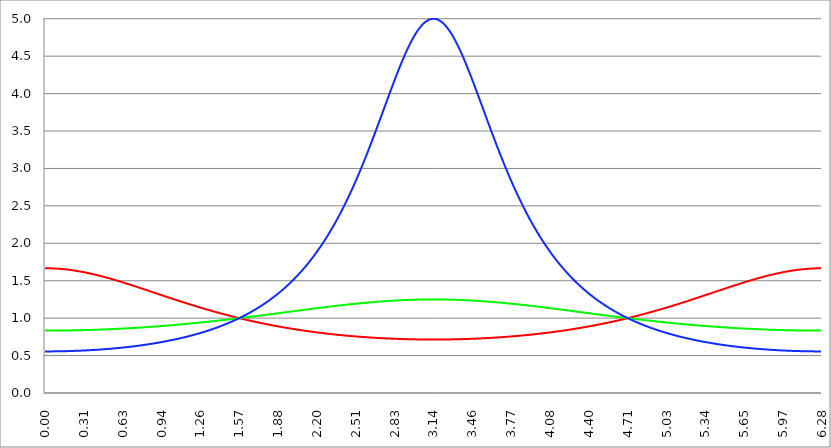
| Category | Series 1 | Series 0 | Series 2 |
|---|---|---|---|
| 0.0 | 1.667 | 0.833 | 0.556 |
| 0.00314159265358979 | 1.667 | 0.833 | 0.556 |
| 0.00628318530717958 | 1.667 | 0.833 | 0.556 |
| 0.00942477796076938 | 1.667 | 0.833 | 0.556 |
| 0.0125663706143592 | 1.667 | 0.833 | 0.556 |
| 0.015707963267949 | 1.667 | 0.833 | 0.556 |
| 0.0188495559215388 | 1.666 | 0.833 | 0.556 |
| 0.0219911485751285 | 1.666 | 0.833 | 0.556 |
| 0.0251327412287183 | 1.666 | 0.833 | 0.556 |
| 0.0282743338823081 | 1.666 | 0.833 | 0.556 |
| 0.0314159265358979 | 1.666 | 0.833 | 0.556 |
| 0.0345575191894877 | 1.666 | 0.833 | 0.556 |
| 0.0376991118430775 | 1.666 | 0.833 | 0.556 |
| 0.0408407044966673 | 1.666 | 0.833 | 0.556 |
| 0.0439822971502571 | 1.666 | 0.833 | 0.556 |
| 0.0471238898038469 | 1.665 | 0.833 | 0.556 |
| 0.0502654824574367 | 1.665 | 0.834 | 0.556 |
| 0.0534070751110265 | 1.665 | 0.834 | 0.556 |
| 0.0565486677646163 | 1.665 | 0.834 | 0.556 |
| 0.059690260418206 | 1.665 | 0.834 | 0.556 |
| 0.0628318530717958 | 1.664 | 0.834 | 0.556 |
| 0.0659734457253856 | 1.664 | 0.834 | 0.556 |
| 0.0691150383789754 | 1.664 | 0.834 | 0.556 |
| 0.0722566310325652 | 1.664 | 0.834 | 0.556 |
| 0.075398223686155 | 1.664 | 0.834 | 0.556 |
| 0.0785398163397448 | 1.663 | 0.834 | 0.556 |
| 0.0816814089933346 | 1.663 | 0.834 | 0.556 |
| 0.0848230016469244 | 1.663 | 0.834 | 0.556 |
| 0.0879645943005142 | 1.662 | 0.834 | 0.557 |
| 0.091106186954104 | 1.662 | 0.834 | 0.557 |
| 0.0942477796076937 | 1.662 | 0.834 | 0.557 |
| 0.0973893722612835 | 1.661 | 0.834 | 0.557 |
| 0.100530964914873 | 1.661 | 0.834 | 0.557 |
| 0.103672557568463 | 1.661 | 0.834 | 0.557 |
| 0.106814150222053 | 1.66 | 0.834 | 0.557 |
| 0.109955742875643 | 1.66 | 0.834 | 0.557 |
| 0.113097335529233 | 1.66 | 0.834 | 0.557 |
| 0.116238928182822 | 1.659 | 0.834 | 0.557 |
| 0.119380520836412 | 1.659 | 0.834 | 0.557 |
| 0.122522113490002 | 1.658 | 0.834 | 0.557 |
| 0.125663706143592 | 1.658 | 0.834 | 0.558 |
| 0.128805298797181 | 1.658 | 0.834 | 0.558 |
| 0.131946891450771 | 1.657 | 0.835 | 0.558 |
| 0.135088484104361 | 1.657 | 0.835 | 0.558 |
| 0.138230076757951 | 1.656 | 0.835 | 0.558 |
| 0.141371669411541 | 1.656 | 0.835 | 0.558 |
| 0.14451326206513 | 1.655 | 0.835 | 0.558 |
| 0.14765485471872 | 1.655 | 0.835 | 0.558 |
| 0.15079644737231 | 1.654 | 0.835 | 0.558 |
| 0.1539380400259 | 1.654 | 0.835 | 0.558 |
| 0.15707963267949 | 1.653 | 0.835 | 0.559 |
| 0.160221225333079 | 1.653 | 0.835 | 0.559 |
| 0.163362817986669 | 1.652 | 0.835 | 0.559 |
| 0.166504410640259 | 1.651 | 0.835 | 0.559 |
| 0.169646003293849 | 1.651 | 0.835 | 0.559 |
| 0.172787595947439 | 1.65 | 0.835 | 0.559 |
| 0.175929188601028 | 1.65 | 0.835 | 0.559 |
| 0.179070781254618 | 1.649 | 0.836 | 0.56 |
| 0.182212373908208 | 1.648 | 0.836 | 0.56 |
| 0.185353966561798 | 1.648 | 0.836 | 0.56 |
| 0.188495559215388 | 1.647 | 0.836 | 0.56 |
| 0.191637151868977 | 1.647 | 0.836 | 0.56 |
| 0.194778744522567 | 1.646 | 0.836 | 0.56 |
| 0.197920337176157 | 1.645 | 0.836 | 0.56 |
| 0.201061929829747 | 1.645 | 0.836 | 0.561 |
| 0.204203522483336 | 1.644 | 0.836 | 0.561 |
| 0.207345115136926 | 1.643 | 0.836 | 0.561 |
| 0.210486707790516 | 1.642 | 0.836 | 0.561 |
| 0.213628300444106 | 1.642 | 0.837 | 0.561 |
| 0.216769893097696 | 1.641 | 0.837 | 0.561 |
| 0.219911485751285 | 1.64 | 0.837 | 0.562 |
| 0.223053078404875 | 1.64 | 0.837 | 0.562 |
| 0.226194671058465 | 1.639 | 0.837 | 0.562 |
| 0.229336263712055 | 1.638 | 0.837 | 0.562 |
| 0.232477856365645 | 1.637 | 0.837 | 0.562 |
| 0.235619449019234 | 1.637 | 0.837 | 0.562 |
| 0.238761041672824 | 1.636 | 0.837 | 0.563 |
| 0.241902634326414 | 1.635 | 0.837 | 0.563 |
| 0.245044226980004 | 1.634 | 0.838 | 0.563 |
| 0.248185819633594 | 1.633 | 0.838 | 0.563 |
| 0.251327412287183 | 1.632 | 0.838 | 0.563 |
| 0.254469004940773 | 1.632 | 0.838 | 0.564 |
| 0.257610597594363 | 1.631 | 0.838 | 0.564 |
| 0.260752190247953 | 1.63 | 0.838 | 0.564 |
| 0.263893782901543 | 1.629 | 0.838 | 0.564 |
| 0.267035375555132 | 1.628 | 0.838 | 0.564 |
| 0.270176968208722 | 1.627 | 0.838 | 0.565 |
| 0.273318560862312 | 1.626 | 0.839 | 0.565 |
| 0.276460153515902 | 1.626 | 0.839 | 0.565 |
| 0.279601746169492 | 1.625 | 0.839 | 0.565 |
| 0.282743338823082 | 1.624 | 0.839 | 0.566 |
| 0.285884931476671 | 1.623 | 0.839 | 0.566 |
| 0.289026524130261 | 1.622 | 0.839 | 0.566 |
| 0.292168116783851 | 1.621 | 0.839 | 0.566 |
| 0.295309709437441 | 1.62 | 0.839 | 0.566 |
| 0.298451302091031 | 1.619 | 0.84 | 0.567 |
| 0.30159289474462 | 1.618 | 0.84 | 0.567 |
| 0.30473448739821 | 1.617 | 0.84 | 0.567 |
| 0.3078760800518 | 1.616 | 0.84 | 0.567 |
| 0.31101767270539 | 1.615 | 0.84 | 0.568 |
| 0.31415926535898 | 1.614 | 0.84 | 0.568 |
| 0.31730085801257 | 1.613 | 0.84 | 0.568 |
| 0.320442450666159 | 1.612 | 0.84 | 0.568 |
| 0.323584043319749 | 1.611 | 0.841 | 0.569 |
| 0.326725635973339 | 1.61 | 0.841 | 0.569 |
| 0.329867228626929 | 1.609 | 0.841 | 0.569 |
| 0.333008821280519 | 1.608 | 0.841 | 0.569 |
| 0.336150413934108 | 1.607 | 0.841 | 0.57 |
| 0.339292006587698 | 1.606 | 0.841 | 0.57 |
| 0.342433599241288 | 1.605 | 0.841 | 0.57 |
| 0.345575191894878 | 1.603 | 0.842 | 0.571 |
| 0.348716784548468 | 1.602 | 0.842 | 0.571 |
| 0.351858377202058 | 1.601 | 0.842 | 0.571 |
| 0.354999969855647 | 1.6 | 0.842 | 0.571 |
| 0.358141562509237 | 1.599 | 0.842 | 0.572 |
| 0.361283155162827 | 1.598 | 0.842 | 0.572 |
| 0.364424747816417 | 1.597 | 0.843 | 0.572 |
| 0.367566340470007 | 1.596 | 0.843 | 0.573 |
| 0.370707933123597 | 1.594 | 0.843 | 0.573 |
| 0.373849525777186 | 1.593 | 0.843 | 0.573 |
| 0.376991118430776 | 1.592 | 0.843 | 0.573 |
| 0.380132711084366 | 1.591 | 0.843 | 0.574 |
| 0.383274303737956 | 1.59 | 0.844 | 0.574 |
| 0.386415896391546 | 1.589 | 0.844 | 0.574 |
| 0.389557489045135 | 1.587 | 0.844 | 0.575 |
| 0.392699081698725 | 1.586 | 0.844 | 0.575 |
| 0.395840674352315 | 1.585 | 0.844 | 0.575 |
| 0.398982267005905 | 1.584 | 0.844 | 0.576 |
| 0.402123859659495 | 1.583 | 0.845 | 0.576 |
| 0.405265452313085 | 1.581 | 0.845 | 0.576 |
| 0.408407044966674 | 1.58 | 0.845 | 0.577 |
| 0.411548637620264 | 1.579 | 0.845 | 0.577 |
| 0.414690230273854 | 1.578 | 0.845 | 0.577 |
| 0.417831822927444 | 1.576 | 0.845 | 0.578 |
| 0.420973415581034 | 1.575 | 0.846 | 0.578 |
| 0.424115008234623 | 1.574 | 0.846 | 0.578 |
| 0.427256600888213 | 1.572 | 0.846 | 0.579 |
| 0.430398193541803 | 1.571 | 0.846 | 0.579 |
| 0.433539786195393 | 1.57 | 0.846 | 0.579 |
| 0.436681378848983 | 1.569 | 0.847 | 0.58 |
| 0.439822971502573 | 1.567 | 0.847 | 0.58 |
| 0.442964564156162 | 1.566 | 0.847 | 0.58 |
| 0.446106156809752 | 1.565 | 0.847 | 0.581 |
| 0.449247749463342 | 1.563 | 0.847 | 0.581 |
| 0.452389342116932 | 1.562 | 0.848 | 0.582 |
| 0.455530934770522 | 1.561 | 0.848 | 0.582 |
| 0.458672527424111 | 1.559 | 0.848 | 0.582 |
| 0.461814120077701 | 1.558 | 0.848 | 0.583 |
| 0.464955712731291 | 1.557 | 0.848 | 0.583 |
| 0.468097305384881 | 1.555 | 0.849 | 0.583 |
| 0.471238898038471 | 1.554 | 0.849 | 0.584 |
| 0.474380490692061 | 1.552 | 0.849 | 0.584 |
| 0.47752208334565 | 1.551 | 0.849 | 0.585 |
| 0.48066367599924 | 1.55 | 0.849 | 0.585 |
| 0.48380526865283 | 1.548 | 0.85 | 0.585 |
| 0.48694686130642 | 1.547 | 0.85 | 0.586 |
| 0.49008845396001 | 1.545 | 0.85 | 0.586 |
| 0.493230046613599 | 1.544 | 0.85 | 0.587 |
| 0.496371639267189 | 1.543 | 0.85 | 0.587 |
| 0.499513231920779 | 1.541 | 0.851 | 0.587 |
| 0.502654824574369 | 1.54 | 0.851 | 0.588 |
| 0.505796417227959 | 1.538 | 0.851 | 0.588 |
| 0.508938009881549 | 1.537 | 0.851 | 0.589 |
| 0.512079602535138 | 1.535 | 0.852 | 0.589 |
| 0.515221195188728 | 1.534 | 0.852 | 0.59 |
| 0.518362787842318 | 1.532 | 0.852 | 0.59 |
| 0.521504380495908 | 1.531 | 0.852 | 0.59 |
| 0.524645973149498 | 1.53 | 0.852 | 0.591 |
| 0.527787565803087 | 1.528 | 0.853 | 0.591 |
| 0.530929158456677 | 1.527 | 0.853 | 0.592 |
| 0.534070751110267 | 1.525 | 0.853 | 0.592 |
| 0.537212343763857 | 1.524 | 0.853 | 0.593 |
| 0.540353936417447 | 1.522 | 0.854 | 0.593 |
| 0.543495529071037 | 1.521 | 0.854 | 0.594 |
| 0.546637121724626 | 1.519 | 0.854 | 0.594 |
| 0.549778714378216 | 1.518 | 0.854 | 0.594 |
| 0.552920307031806 | 1.516 | 0.855 | 0.595 |
| 0.556061899685396 | 1.515 | 0.855 | 0.595 |
| 0.559203492338986 | 1.513 | 0.855 | 0.596 |
| 0.562345084992576 | 1.511 | 0.855 | 0.596 |
| 0.565486677646165 | 1.51 | 0.856 | 0.597 |
| 0.568628270299755 | 1.508 | 0.856 | 0.597 |
| 0.571769862953345 | 1.507 | 0.856 | 0.598 |
| 0.574911455606935 | 1.505 | 0.856 | 0.598 |
| 0.578053048260525 | 1.504 | 0.857 | 0.599 |
| 0.581194640914114 | 1.502 | 0.857 | 0.599 |
| 0.584336233567704 | 1.501 | 0.857 | 0.6 |
| 0.587477826221294 | 1.499 | 0.857 | 0.6 |
| 0.590619418874884 | 1.498 | 0.858 | 0.601 |
| 0.593761011528474 | 1.496 | 0.858 | 0.601 |
| 0.596902604182064 | 1.494 | 0.858 | 0.602 |
| 0.600044196835653 | 1.493 | 0.858 | 0.602 |
| 0.603185789489243 | 1.491 | 0.859 | 0.603 |
| 0.606327382142833 | 1.49 | 0.859 | 0.603 |
| 0.609468974796423 | 1.488 | 0.859 | 0.604 |
| 0.612610567450013 | 1.486 | 0.859 | 0.604 |
| 0.615752160103602 | 1.485 | 0.86 | 0.605 |
| 0.618893752757192 | 1.483 | 0.86 | 0.605 |
| 0.622035345410782 | 1.482 | 0.86 | 0.606 |
| 0.625176938064372 | 1.48 | 0.86 | 0.607 |
| 0.628318530717962 | 1.478 | 0.861 | 0.607 |
| 0.631460123371551 | 1.477 | 0.861 | 0.608 |
| 0.634601716025141 | 1.475 | 0.861 | 0.608 |
| 0.637743308678731 | 1.474 | 0.862 | 0.609 |
| 0.640884901332321 | 1.472 | 0.862 | 0.609 |
| 0.644026493985911 | 1.47 | 0.862 | 0.61 |
| 0.647168086639501 | 1.469 | 0.862 | 0.61 |
| 0.65030967929309 | 1.467 | 0.863 | 0.611 |
| 0.65345127194668 | 1.465 | 0.863 | 0.612 |
| 0.65659286460027 | 1.464 | 0.863 | 0.612 |
| 0.65973445725386 | 1.462 | 0.864 | 0.613 |
| 0.66287604990745 | 1.46 | 0.864 | 0.613 |
| 0.666017642561039 | 1.459 | 0.864 | 0.614 |
| 0.669159235214629 | 1.457 | 0.864 | 0.614 |
| 0.672300827868219 | 1.456 | 0.865 | 0.615 |
| 0.675442420521809 | 1.454 | 0.865 | 0.616 |
| 0.678584013175399 | 1.452 | 0.865 | 0.616 |
| 0.681725605828989 | 1.451 | 0.866 | 0.617 |
| 0.684867198482578 | 1.449 | 0.866 | 0.617 |
| 0.688008791136168 | 1.447 | 0.866 | 0.618 |
| 0.691150383789758 | 1.446 | 0.866 | 0.619 |
| 0.694291976443348 | 1.444 | 0.867 | 0.619 |
| 0.697433569096938 | 1.442 | 0.867 | 0.62 |
| 0.700575161750528 | 1.44 | 0.867 | 0.621 |
| 0.703716754404117 | 1.439 | 0.868 | 0.621 |
| 0.706858347057707 | 1.437 | 0.868 | 0.622 |
| 0.709999939711297 | 1.435 | 0.868 | 0.622 |
| 0.713141532364887 | 1.434 | 0.869 | 0.623 |
| 0.716283125018477 | 1.432 | 0.869 | 0.624 |
| 0.719424717672066 | 1.43 | 0.869 | 0.624 |
| 0.722566310325656 | 1.429 | 0.87 | 0.625 |
| 0.725707902979246 | 1.427 | 0.87 | 0.626 |
| 0.728849495632836 | 1.425 | 0.87 | 0.626 |
| 0.731991088286426 | 1.424 | 0.87 | 0.627 |
| 0.735132680940016 | 1.422 | 0.871 | 0.628 |
| 0.738274273593605 | 1.42 | 0.871 | 0.628 |
| 0.741415866247195 | 1.418 | 0.871 | 0.629 |
| 0.744557458900785 | 1.417 | 0.872 | 0.63 |
| 0.747699051554375 | 1.415 | 0.872 | 0.63 |
| 0.750840644207965 | 1.413 | 0.872 | 0.631 |
| 0.753982236861554 | 1.412 | 0.873 | 0.632 |
| 0.757123829515144 | 1.41 | 0.873 | 0.632 |
| 0.760265422168734 | 1.408 | 0.873 | 0.633 |
| 0.763407014822324 | 1.406 | 0.874 | 0.634 |
| 0.766548607475914 | 1.405 | 0.874 | 0.634 |
| 0.769690200129504 | 1.403 | 0.874 | 0.635 |
| 0.772831792783093 | 1.401 | 0.875 | 0.636 |
| 0.775973385436683 | 1.4 | 0.875 | 0.637 |
| 0.779114978090273 | 1.398 | 0.875 | 0.637 |
| 0.782256570743863 | 1.396 | 0.876 | 0.638 |
| 0.785398163397453 | 1.394 | 0.876 | 0.639 |
| 0.788539756051042 | 1.393 | 0.876 | 0.639 |
| 0.791681348704632 | 1.391 | 0.877 | 0.64 |
| 0.794822941358222 | 1.389 | 0.877 | 0.641 |
| 0.797964534011812 | 1.387 | 0.877 | 0.642 |
| 0.801106126665402 | 1.386 | 0.878 | 0.642 |
| 0.804247719318992 | 1.384 | 0.878 | 0.643 |
| 0.807389311972581 | 1.382 | 0.879 | 0.644 |
| 0.810530904626171 | 1.381 | 0.879 | 0.645 |
| 0.813672497279761 | 1.379 | 0.879 | 0.645 |
| 0.816814089933351 | 1.377 | 0.88 | 0.646 |
| 0.819955682586941 | 1.375 | 0.88 | 0.647 |
| 0.823097275240531 | 1.374 | 0.88 | 0.648 |
| 0.82623886789412 | 1.372 | 0.881 | 0.648 |
| 0.82938046054771 | 1.37 | 0.881 | 0.649 |
| 0.8325220532013 | 1.368 | 0.881 | 0.65 |
| 0.83566364585489 | 1.367 | 0.882 | 0.651 |
| 0.83880523850848 | 1.365 | 0.882 | 0.652 |
| 0.841946831162069 | 1.363 | 0.882 | 0.652 |
| 0.845088423815659 | 1.361 | 0.883 | 0.653 |
| 0.848230016469249 | 1.36 | 0.883 | 0.654 |
| 0.851371609122839 | 1.358 | 0.884 | 0.655 |
| 0.854513201776429 | 1.356 | 0.884 | 0.656 |
| 0.857654794430019 | 1.354 | 0.884 | 0.656 |
| 0.860796387083608 | 1.353 | 0.885 | 0.657 |
| 0.863937979737198 | 1.351 | 0.885 | 0.658 |
| 0.867079572390788 | 1.349 | 0.885 | 0.659 |
| 0.870221165044378 | 1.347 | 0.886 | 0.66 |
| 0.873362757697968 | 1.346 | 0.886 | 0.661 |
| 0.876504350351557 | 1.344 | 0.887 | 0.661 |
| 0.879645943005147 | 1.342 | 0.887 | 0.662 |
| 0.882787535658737 | 1.34 | 0.887 | 0.663 |
| 0.885929128312327 | 1.339 | 0.888 | 0.664 |
| 0.889070720965917 | 1.337 | 0.888 | 0.665 |
| 0.892212313619507 | 1.335 | 0.888 | 0.666 |
| 0.895353906273096 | 1.334 | 0.889 | 0.667 |
| 0.898495498926686 | 1.332 | 0.889 | 0.667 |
| 0.901637091580276 | 1.33 | 0.89 | 0.668 |
| 0.904778684233866 | 1.328 | 0.89 | 0.669 |
| 0.907920276887456 | 1.327 | 0.89 | 0.67 |
| 0.911061869541045 | 1.325 | 0.891 | 0.671 |
| 0.914203462194635 | 1.323 | 0.891 | 0.672 |
| 0.917345054848225 | 1.321 | 0.892 | 0.673 |
| 0.920486647501815 | 1.32 | 0.892 | 0.674 |
| 0.923628240155405 | 1.318 | 0.892 | 0.675 |
| 0.926769832808995 | 1.316 | 0.893 | 0.676 |
| 0.929911425462584 | 1.314 | 0.893 | 0.676 |
| 0.933053018116174 | 1.313 | 0.894 | 0.677 |
| 0.936194610769764 | 1.311 | 0.894 | 0.678 |
| 0.939336203423354 | 1.309 | 0.894 | 0.679 |
| 0.942477796076944 | 1.307 | 0.895 | 0.68 |
| 0.945619388730533 | 1.306 | 0.895 | 0.681 |
| 0.948760981384123 | 1.304 | 0.896 | 0.682 |
| 0.951902574037713 | 1.302 | 0.896 | 0.683 |
| 0.955044166691303 | 1.3 | 0.896 | 0.684 |
| 0.958185759344893 | 1.299 | 0.897 | 0.685 |
| 0.961327351998483 | 1.297 | 0.897 | 0.686 |
| 0.964468944652072 | 1.295 | 0.898 | 0.687 |
| 0.967610537305662 | 1.294 | 0.898 | 0.688 |
| 0.970752129959252 | 1.292 | 0.899 | 0.689 |
| 0.973893722612842 | 1.29 | 0.899 | 0.69 |
| 0.977035315266432 | 1.288 | 0.899 | 0.691 |
| 0.980176907920022 | 1.287 | 0.9 | 0.692 |
| 0.983318500573611 | 1.285 | 0.9 | 0.693 |
| 0.986460093227201 | 1.283 | 0.901 | 0.694 |
| 0.989601685880791 | 1.281 | 0.901 | 0.695 |
| 0.992743278534381 | 1.28 | 0.901 | 0.696 |
| 0.995884871187971 | 1.278 | 0.902 | 0.697 |
| 0.99902646384156 | 1.276 | 0.902 | 0.698 |
| 1.00216805649515 | 1.275 | 0.903 | 0.699 |
| 1.00530964914874 | 1.273 | 0.903 | 0.7 |
| 1.00845124180233 | 1.271 | 0.904 | 0.701 |
| 1.01159283445592 | 1.269 | 0.904 | 0.702 |
| 1.01473442710951 | 1.268 | 0.905 | 0.703 |
| 1.017876019763099 | 1.266 | 0.905 | 0.704 |
| 1.021017612416689 | 1.264 | 0.905 | 0.705 |
| 1.02415920507028 | 1.263 | 0.906 | 0.706 |
| 1.027300797723869 | 1.261 | 0.906 | 0.707 |
| 1.030442390377459 | 1.259 | 0.907 | 0.708 |
| 1.033583983031048 | 1.257 | 0.907 | 0.71 |
| 1.036725575684638 | 1.256 | 0.908 | 0.711 |
| 1.039867168338228 | 1.254 | 0.908 | 0.712 |
| 1.043008760991818 | 1.252 | 0.908 | 0.713 |
| 1.046150353645408 | 1.251 | 0.909 | 0.714 |
| 1.049291946298998 | 1.249 | 0.909 | 0.715 |
| 1.052433538952587 | 1.247 | 0.91 | 0.716 |
| 1.055575131606177 | 1.245 | 0.91 | 0.717 |
| 1.058716724259767 | 1.244 | 0.911 | 0.718 |
| 1.061858316913357 | 1.242 | 0.911 | 0.72 |
| 1.064999909566947 | 1.24 | 0.912 | 0.721 |
| 1.068141502220536 | 1.239 | 0.912 | 0.722 |
| 1.071283094874126 | 1.237 | 0.913 | 0.723 |
| 1.074424687527716 | 1.235 | 0.913 | 0.724 |
| 1.077566280181306 | 1.234 | 0.913 | 0.725 |
| 1.080707872834896 | 1.232 | 0.914 | 0.726 |
| 1.083849465488486 | 1.23 | 0.914 | 0.728 |
| 1.086991058142075 | 1.229 | 0.915 | 0.729 |
| 1.090132650795665 | 1.227 | 0.915 | 0.73 |
| 1.093274243449255 | 1.225 | 0.916 | 0.731 |
| 1.096415836102845 | 1.224 | 0.916 | 0.732 |
| 1.099557428756435 | 1.222 | 0.917 | 0.734 |
| 1.102699021410025 | 1.22 | 0.917 | 0.735 |
| 1.105840614063614 | 1.219 | 0.918 | 0.736 |
| 1.108982206717204 | 1.217 | 0.918 | 0.737 |
| 1.112123799370794 | 1.215 | 0.919 | 0.738 |
| 1.115265392024384 | 1.214 | 0.919 | 0.74 |
| 1.118406984677974 | 1.212 | 0.92 | 0.741 |
| 1.121548577331563 | 1.21 | 0.92 | 0.742 |
| 1.124690169985153 | 1.209 | 0.921 | 0.743 |
| 1.127831762638743 | 1.207 | 0.921 | 0.745 |
| 1.130973355292333 | 1.205 | 0.922 | 0.746 |
| 1.134114947945923 | 1.204 | 0.922 | 0.747 |
| 1.137256540599513 | 1.202 | 0.922 | 0.748 |
| 1.140398133253102 | 1.2 | 0.923 | 0.75 |
| 1.143539725906692 | 1.199 | 0.923 | 0.751 |
| 1.146681318560282 | 1.197 | 0.924 | 0.752 |
| 1.149822911213872 | 1.195 | 0.924 | 0.754 |
| 1.152964503867462 | 1.194 | 0.925 | 0.755 |
| 1.156106096521051 | 1.192 | 0.925 | 0.756 |
| 1.159247689174641 | 1.19 | 0.926 | 0.758 |
| 1.162389281828231 | 1.189 | 0.926 | 0.759 |
| 1.165530874481821 | 1.187 | 0.927 | 0.76 |
| 1.168672467135411 | 1.186 | 0.927 | 0.762 |
| 1.171814059789001 | 1.184 | 0.928 | 0.763 |
| 1.17495565244259 | 1.182 | 0.928 | 0.764 |
| 1.17809724509618 | 1.181 | 0.929 | 0.766 |
| 1.18123883774977 | 1.179 | 0.929 | 0.767 |
| 1.18438043040336 | 1.178 | 0.93 | 0.768 |
| 1.18752202305695 | 1.176 | 0.93 | 0.77 |
| 1.190663615710539 | 1.174 | 0.931 | 0.771 |
| 1.193805208364129 | 1.173 | 0.931 | 0.772 |
| 1.19694680101772 | 1.171 | 0.932 | 0.774 |
| 1.200088393671309 | 1.169 | 0.932 | 0.775 |
| 1.203229986324899 | 1.168 | 0.933 | 0.777 |
| 1.206371578978489 | 1.166 | 0.933 | 0.778 |
| 1.209513171632078 | 1.165 | 0.934 | 0.78 |
| 1.212654764285668 | 1.163 | 0.934 | 0.781 |
| 1.215796356939258 | 1.161 | 0.935 | 0.782 |
| 1.218937949592848 | 1.16 | 0.936 | 0.784 |
| 1.222079542246438 | 1.158 | 0.936 | 0.785 |
| 1.225221134900027 | 1.157 | 0.937 | 0.787 |
| 1.228362727553617 | 1.155 | 0.937 | 0.788 |
| 1.231504320207207 | 1.154 | 0.938 | 0.79 |
| 1.234645912860797 | 1.152 | 0.938 | 0.791 |
| 1.237787505514387 | 1.15 | 0.939 | 0.793 |
| 1.240929098167977 | 1.149 | 0.939 | 0.794 |
| 1.244070690821566 | 1.147 | 0.94 | 0.796 |
| 1.247212283475156 | 1.146 | 0.94 | 0.797 |
| 1.250353876128746 | 1.144 | 0.941 | 0.799 |
| 1.253495468782336 | 1.143 | 0.941 | 0.8 |
| 1.256637061435926 | 1.141 | 0.942 | 0.802 |
| 1.259778654089515 | 1.139 | 0.942 | 0.803 |
| 1.262920246743105 | 1.138 | 0.943 | 0.805 |
| 1.266061839396695 | 1.136 | 0.943 | 0.806 |
| 1.269203432050285 | 1.135 | 0.944 | 0.808 |
| 1.272345024703875 | 1.133 | 0.944 | 0.81 |
| 1.275486617357465 | 1.132 | 0.945 | 0.811 |
| 1.278628210011054 | 1.13 | 0.946 | 0.813 |
| 1.281769802664644 | 1.129 | 0.946 | 0.814 |
| 1.284911395318234 | 1.127 | 0.947 | 0.816 |
| 1.288052987971824 | 1.126 | 0.947 | 0.818 |
| 1.291194580625414 | 1.124 | 0.948 | 0.819 |
| 1.294336173279003 | 1.123 | 0.948 | 0.821 |
| 1.297477765932593 | 1.121 | 0.949 | 0.822 |
| 1.300619358586183 | 1.12 | 0.949 | 0.824 |
| 1.303760951239773 | 1.118 | 0.95 | 0.826 |
| 1.306902543893363 | 1.116 | 0.95 | 0.827 |
| 1.310044136546953 | 1.115 | 0.951 | 0.829 |
| 1.313185729200542 | 1.113 | 0.952 | 0.831 |
| 1.316327321854132 | 1.112 | 0.952 | 0.832 |
| 1.319468914507722 | 1.11 | 0.953 | 0.834 |
| 1.322610507161312 | 1.109 | 0.953 | 0.836 |
| 1.325752099814902 | 1.107 | 0.954 | 0.837 |
| 1.328893692468491 | 1.106 | 0.954 | 0.839 |
| 1.332035285122081 | 1.104 | 0.955 | 0.841 |
| 1.335176877775671 | 1.103 | 0.955 | 0.843 |
| 1.338318470429261 | 1.102 | 0.956 | 0.844 |
| 1.341460063082851 | 1.1 | 0.957 | 0.846 |
| 1.344601655736441 | 1.099 | 0.957 | 0.848 |
| 1.34774324839003 | 1.097 | 0.958 | 0.85 |
| 1.35088484104362 | 1.096 | 0.958 | 0.851 |
| 1.35402643369721 | 1.094 | 0.959 | 0.853 |
| 1.3571680263508 | 1.093 | 0.959 | 0.855 |
| 1.36030961900439 | 1.091 | 0.96 | 0.857 |
| 1.363451211657979 | 1.09 | 0.96 | 0.859 |
| 1.36659280431157 | 1.088 | 0.961 | 0.86 |
| 1.369734396965159 | 1.087 | 0.962 | 0.862 |
| 1.372875989618749 | 1.085 | 0.962 | 0.864 |
| 1.376017582272339 | 1.084 | 0.963 | 0.866 |
| 1.379159174925929 | 1.082 | 0.963 | 0.868 |
| 1.382300767579518 | 1.081 | 0.964 | 0.87 |
| 1.385442360233108 | 1.08 | 0.964 | 0.872 |
| 1.388583952886698 | 1.078 | 0.965 | 0.873 |
| 1.391725545540288 | 1.077 | 0.966 | 0.875 |
| 1.394867138193878 | 1.075 | 0.966 | 0.877 |
| 1.398008730847468 | 1.074 | 0.967 | 0.879 |
| 1.401150323501057 | 1.072 | 0.967 | 0.881 |
| 1.404291916154647 | 1.071 | 0.968 | 0.883 |
| 1.407433508808237 | 1.07 | 0.968 | 0.885 |
| 1.410575101461827 | 1.068 | 0.969 | 0.887 |
| 1.413716694115417 | 1.067 | 0.97 | 0.889 |
| 1.416858286769006 | 1.065 | 0.97 | 0.891 |
| 1.419999879422596 | 1.064 | 0.971 | 0.893 |
| 1.423141472076186 | 1.063 | 0.971 | 0.895 |
| 1.426283064729776 | 1.061 | 0.972 | 0.897 |
| 1.429424657383366 | 1.06 | 0.973 | 0.899 |
| 1.432566250036956 | 1.058 | 0.973 | 0.901 |
| 1.435707842690545 | 1.057 | 0.974 | 0.903 |
| 1.438849435344135 | 1.056 | 0.974 | 0.905 |
| 1.441991027997725 | 1.054 | 0.975 | 0.907 |
| 1.445132620651315 | 1.053 | 0.976 | 0.909 |
| 1.448274213304905 | 1.051 | 0.976 | 0.911 |
| 1.451415805958494 | 1.05 | 0.977 | 0.913 |
| 1.454557398612084 | 1.049 | 0.977 | 0.915 |
| 1.457698991265674 | 1.047 | 0.978 | 0.917 |
| 1.460840583919264 | 1.046 | 0.979 | 0.919 |
| 1.463982176572854 | 1.045 | 0.979 | 0.921 |
| 1.467123769226444 | 1.043 | 0.98 | 0.924 |
| 1.470265361880033 | 1.042 | 0.98 | 0.926 |
| 1.473406954533623 | 1.04 | 0.981 | 0.928 |
| 1.476548547187213 | 1.039 | 0.982 | 0.93 |
| 1.479690139840803 | 1.038 | 0.982 | 0.932 |
| 1.482831732494393 | 1.036 | 0.983 | 0.934 |
| 1.485973325147982 | 1.035 | 0.983 | 0.937 |
| 1.489114917801572 | 1.034 | 0.984 | 0.939 |
| 1.492256510455162 | 1.032 | 0.985 | 0.941 |
| 1.495398103108752 | 1.031 | 0.985 | 0.943 |
| 1.498539695762342 | 1.03 | 0.986 | 0.945 |
| 1.501681288415932 | 1.028 | 0.986 | 0.948 |
| 1.504822881069521 | 1.027 | 0.987 | 0.95 |
| 1.507964473723111 | 1.026 | 0.988 | 0.952 |
| 1.511106066376701 | 1.024 | 0.988 | 0.954 |
| 1.514247659030291 | 1.023 | 0.989 | 0.957 |
| 1.517389251683881 | 1.022 | 0.989 | 0.959 |
| 1.520530844337471 | 1.021 | 0.99 | 0.961 |
| 1.52367243699106 | 1.019 | 0.991 | 0.964 |
| 1.52681402964465 | 1.018 | 0.991 | 0.966 |
| 1.52995562229824 | 1.017 | 0.992 | 0.968 |
| 1.53309721495183 | 1.015 | 0.993 | 0.971 |
| 1.53623880760542 | 1.014 | 0.993 | 0.973 |
| 1.539380400259009 | 1.013 | 0.994 | 0.975 |
| 1.542521992912599 | 1.011 | 0.994 | 0.978 |
| 1.545663585566189 | 1.01 | 0.995 | 0.98 |
| 1.548805178219779 | 1.009 | 0.996 | 0.983 |
| 1.551946770873369 | 1.008 | 0.996 | 0.985 |
| 1.555088363526959 | 1.006 | 0.997 | 0.988 |
| 1.558229956180548 | 1.005 | 0.997 | 0.99 |
| 1.561371548834138 | 1.004 | 0.998 | 0.993 |
| 1.564513141487728 | 1.003 | 0.999 | 0.995 |
| 1.567654734141318 | 1.001 | 0.999 | 0.997 |
| 1.570796326794908 | 1 | 1 | 1 |
| 1.573937919448497 | 0.999 | 1.001 | 1.003 |
| 1.577079512102087 | 0.997 | 1.001 | 1.005 |
| 1.580221104755677 | 0.996 | 1.002 | 1.008 |
| 1.583362697409267 | 0.995 | 1.003 | 1.01 |
| 1.586504290062857 | 0.994 | 1.003 | 1.013 |
| 1.589645882716447 | 0.993 | 1.004 | 1.015 |
| 1.592787475370036 | 0.991 | 1.004 | 1.018 |
| 1.595929068023626 | 0.99 | 1.005 | 1.021 |
| 1.599070660677216 | 0.989 | 1.006 | 1.023 |
| 1.602212253330806 | 0.988 | 1.006 | 1.026 |
| 1.605353845984396 | 0.986 | 1.007 | 1.028 |
| 1.608495438637985 | 0.985 | 1.008 | 1.031 |
| 1.611637031291575 | 0.984 | 1.008 | 1.034 |
| 1.614778623945165 | 0.983 | 1.009 | 1.036 |
| 1.617920216598755 | 0.982 | 1.01 | 1.039 |
| 1.621061809252345 | 0.98 | 1.01 | 1.042 |
| 1.624203401905935 | 0.979 | 1.011 | 1.045 |
| 1.627344994559524 | 0.978 | 1.011 | 1.047 |
| 1.630486587213114 | 0.977 | 1.012 | 1.05 |
| 1.633628179866704 | 0.975 | 1.013 | 1.053 |
| 1.636769772520294 | 0.974 | 1.013 | 1.056 |
| 1.639911365173884 | 0.973 | 1.014 | 1.058 |
| 1.643052957827473 | 0.972 | 1.015 | 1.061 |
| 1.646194550481063 | 0.971 | 1.015 | 1.064 |
| 1.649336143134653 | 0.97 | 1.016 | 1.067 |
| 1.652477735788243 | 0.968 | 1.017 | 1.07 |
| 1.655619328441833 | 0.967 | 1.017 | 1.073 |
| 1.658760921095423 | 0.966 | 1.018 | 1.076 |
| 1.661902513749012 | 0.965 | 1.019 | 1.078 |
| 1.665044106402602 | 0.964 | 1.019 | 1.081 |
| 1.668185699056192 | 0.963 | 1.02 | 1.084 |
| 1.671327291709782 | 0.961 | 1.02 | 1.087 |
| 1.674468884363372 | 0.96 | 1.021 | 1.09 |
| 1.677610477016961 | 0.959 | 1.022 | 1.093 |
| 1.680752069670551 | 0.958 | 1.022 | 1.096 |
| 1.683893662324141 | 0.957 | 1.023 | 1.099 |
| 1.687035254977731 | 0.956 | 1.024 | 1.102 |
| 1.690176847631321 | 0.955 | 1.024 | 1.105 |
| 1.693318440284911 | 0.953 | 1.025 | 1.108 |
| 1.6964600329385 | 0.952 | 1.026 | 1.111 |
| 1.69960162559209 | 0.951 | 1.026 | 1.115 |
| 1.70274321824568 | 0.95 | 1.027 | 1.118 |
| 1.70588481089927 | 0.949 | 1.028 | 1.121 |
| 1.70902640355286 | 0.948 | 1.028 | 1.124 |
| 1.712167996206449 | 0.947 | 1.029 | 1.127 |
| 1.715309588860039 | 0.946 | 1.03 | 1.13 |
| 1.71845118151363 | 0.944 | 1.03 | 1.133 |
| 1.721592774167219 | 0.943 | 1.031 | 1.137 |
| 1.724734366820809 | 0.942 | 1.032 | 1.14 |
| 1.727875959474399 | 0.941 | 1.032 | 1.143 |
| 1.731017552127988 | 0.94 | 1.033 | 1.146 |
| 1.734159144781578 | 0.939 | 1.034 | 1.15 |
| 1.737300737435168 | 0.938 | 1.034 | 1.153 |
| 1.740442330088758 | 0.937 | 1.035 | 1.156 |
| 1.743583922742348 | 0.936 | 1.036 | 1.159 |
| 1.746725515395937 | 0.935 | 1.036 | 1.163 |
| 1.749867108049527 | 0.933 | 1.037 | 1.166 |
| 1.753008700703117 | 0.932 | 1.038 | 1.17 |
| 1.756150293356707 | 0.931 | 1.038 | 1.173 |
| 1.759291886010297 | 0.93 | 1.039 | 1.176 |
| 1.762433478663887 | 0.929 | 1.04 | 1.18 |
| 1.765575071317476 | 0.928 | 1.04 | 1.183 |
| 1.768716663971066 | 0.927 | 1.041 | 1.187 |
| 1.771858256624656 | 0.926 | 1.042 | 1.19 |
| 1.774999849278246 | 0.925 | 1.042 | 1.194 |
| 1.778141441931836 | 0.924 | 1.043 | 1.197 |
| 1.781283034585426 | 0.923 | 1.044 | 1.201 |
| 1.784424627239015 | 0.922 | 1.044 | 1.204 |
| 1.787566219892605 | 0.921 | 1.045 | 1.208 |
| 1.790707812546195 | 0.92 | 1.046 | 1.211 |
| 1.793849405199785 | 0.919 | 1.046 | 1.215 |
| 1.796990997853375 | 0.918 | 1.047 | 1.219 |
| 1.800132590506964 | 0.917 | 1.048 | 1.222 |
| 1.803274183160554 | 0.916 | 1.048 | 1.226 |
| 1.806415775814144 | 0.915 | 1.049 | 1.23 |
| 1.809557368467734 | 0.914 | 1.05 | 1.233 |
| 1.812698961121324 | 0.913 | 1.05 | 1.237 |
| 1.815840553774914 | 0.912 | 1.051 | 1.241 |
| 1.818982146428503 | 0.911 | 1.052 | 1.245 |
| 1.822123739082093 | 0.91 | 1.052 | 1.248 |
| 1.825265331735683 | 0.909 | 1.053 | 1.252 |
| 1.828406924389273 | 0.908 | 1.054 | 1.256 |
| 1.831548517042863 | 0.907 | 1.054 | 1.26 |
| 1.834690109696452 | 0.906 | 1.055 | 1.264 |
| 1.837831702350042 | 0.905 | 1.056 | 1.268 |
| 1.840973295003632 | 0.904 | 1.056 | 1.271 |
| 1.844114887657222 | 0.903 | 1.057 | 1.275 |
| 1.847256480310812 | 0.902 | 1.058 | 1.279 |
| 1.850398072964402 | 0.901 | 1.058 | 1.283 |
| 1.853539665617991 | 0.9 | 1.059 | 1.287 |
| 1.856681258271581 | 0.899 | 1.06 | 1.291 |
| 1.859822850925171 | 0.898 | 1.06 | 1.295 |
| 1.862964443578761 | 0.897 | 1.061 | 1.299 |
| 1.866106036232351 | 0.896 | 1.062 | 1.303 |
| 1.86924762888594 | 0.895 | 1.062 | 1.308 |
| 1.87238922153953 | 0.894 | 1.063 | 1.312 |
| 1.87553081419312 | 0.893 | 1.064 | 1.316 |
| 1.87867240684671 | 0.892 | 1.065 | 1.32 |
| 1.8818139995003 | 0.891 | 1.065 | 1.324 |
| 1.88495559215389 | 0.89 | 1.066 | 1.328 |
| 1.888097184807479 | 0.889 | 1.067 | 1.333 |
| 1.891238777461069 | 0.888 | 1.067 | 1.337 |
| 1.89438037011466 | 0.887 | 1.068 | 1.341 |
| 1.897521962768249 | 0.886 | 1.069 | 1.345 |
| 1.900663555421839 | 0.885 | 1.069 | 1.35 |
| 1.903805148075429 | 0.884 | 1.07 | 1.354 |
| 1.906946740729018 | 0.883 | 1.071 | 1.358 |
| 1.910088333382608 | 0.883 | 1.071 | 1.363 |
| 1.913229926036198 | 0.882 | 1.072 | 1.367 |
| 1.916371518689788 | 0.881 | 1.073 | 1.372 |
| 1.919513111343378 | 0.88 | 1.073 | 1.376 |
| 1.922654703996967 | 0.879 | 1.074 | 1.381 |
| 1.925796296650557 | 0.878 | 1.075 | 1.385 |
| 1.928937889304147 | 0.877 | 1.075 | 1.39 |
| 1.932079481957737 | 0.876 | 1.076 | 1.394 |
| 1.935221074611327 | 0.875 | 1.077 | 1.399 |
| 1.938362667264917 | 0.874 | 1.077 | 1.403 |
| 1.941504259918506 | 0.873 | 1.078 | 1.408 |
| 1.944645852572096 | 0.873 | 1.079 | 1.413 |
| 1.947787445225686 | 0.872 | 1.079 | 1.417 |
| 1.950929037879276 | 0.871 | 1.08 | 1.422 |
| 1.954070630532866 | 0.87 | 1.081 | 1.427 |
| 1.957212223186455 | 0.869 | 1.082 | 1.432 |
| 1.960353815840045 | 0.868 | 1.082 | 1.436 |
| 1.963495408493635 | 0.867 | 1.083 | 1.441 |
| 1.966637001147225 | 0.866 | 1.084 | 1.446 |
| 1.969778593800815 | 0.866 | 1.084 | 1.451 |
| 1.972920186454405 | 0.865 | 1.085 | 1.456 |
| 1.976061779107994 | 0.864 | 1.086 | 1.461 |
| 1.979203371761584 | 0.863 | 1.086 | 1.466 |
| 1.982344964415174 | 0.862 | 1.087 | 1.471 |
| 1.985486557068764 | 0.861 | 1.088 | 1.476 |
| 1.988628149722354 | 0.86 | 1.088 | 1.481 |
| 1.991769742375943 | 0.86 | 1.089 | 1.486 |
| 1.994911335029533 | 0.859 | 1.09 | 1.491 |
| 1.998052927683123 | 0.858 | 1.09 | 1.496 |
| 2.001194520336712 | 0.857 | 1.091 | 1.501 |
| 2.004336112990302 | 0.856 | 1.092 | 1.506 |
| 2.007477705643892 | 0.855 | 1.092 | 1.511 |
| 2.010619298297482 | 0.854 | 1.093 | 1.517 |
| 2.013760890951071 | 0.854 | 1.094 | 1.522 |
| 2.016902483604661 | 0.853 | 1.094 | 1.527 |
| 2.02004407625825 | 0.852 | 1.095 | 1.532 |
| 2.02318566891184 | 0.851 | 1.096 | 1.538 |
| 2.02632726156543 | 0.85 | 1.096 | 1.543 |
| 2.029468854219019 | 0.85 | 1.097 | 1.548 |
| 2.032610446872609 | 0.849 | 1.098 | 1.554 |
| 2.035752039526198 | 0.848 | 1.099 | 1.559 |
| 2.038893632179788 | 0.847 | 1.099 | 1.565 |
| 2.042035224833378 | 0.846 | 1.1 | 1.57 |
| 2.045176817486967 | 0.846 | 1.101 | 1.576 |
| 2.048318410140557 | 0.845 | 1.101 | 1.581 |
| 2.051460002794146 | 0.844 | 1.102 | 1.587 |
| 2.054601595447736 | 0.843 | 1.103 | 1.593 |
| 2.057743188101325 | 0.842 | 1.103 | 1.598 |
| 2.060884780754915 | 0.842 | 1.104 | 1.604 |
| 2.064026373408505 | 0.841 | 1.105 | 1.61 |
| 2.067167966062094 | 0.84 | 1.105 | 1.615 |
| 2.070309558715684 | 0.839 | 1.106 | 1.621 |
| 2.073451151369273 | 0.838 | 1.107 | 1.627 |
| 2.076592744022863 | 0.838 | 1.107 | 1.633 |
| 2.079734336676452 | 0.837 | 1.108 | 1.639 |
| 2.082875929330042 | 0.836 | 1.109 | 1.645 |
| 2.086017521983632 | 0.835 | 1.109 | 1.651 |
| 2.089159114637221 | 0.835 | 1.11 | 1.657 |
| 2.092300707290811 | 0.834 | 1.111 | 1.663 |
| 2.095442299944401 | 0.833 | 1.111 | 1.669 |
| 2.09858389259799 | 0.832 | 1.112 | 1.675 |
| 2.10172548525158 | 0.832 | 1.113 | 1.681 |
| 2.104867077905169 | 0.831 | 1.113 | 1.687 |
| 2.108008670558759 | 0.83 | 1.114 | 1.693 |
| 2.111150263212349 | 0.829 | 1.115 | 1.699 |
| 2.114291855865938 | 0.829 | 1.115 | 1.706 |
| 2.117433448519528 | 0.828 | 1.116 | 1.712 |
| 2.120575041173117 | 0.827 | 1.117 | 1.718 |
| 2.123716633826707 | 0.826 | 1.117 | 1.725 |
| 2.126858226480297 | 0.826 | 1.118 | 1.731 |
| 2.129999819133886 | 0.825 | 1.119 | 1.737 |
| 2.133141411787476 | 0.824 | 1.119 | 1.744 |
| 2.136283004441065 | 0.823 | 1.12 | 1.75 |
| 2.139424597094655 | 0.823 | 1.121 | 1.757 |
| 2.142566189748245 | 0.822 | 1.121 | 1.763 |
| 2.145707782401834 | 0.821 | 1.122 | 1.77 |
| 2.148849375055424 | 0.821 | 1.123 | 1.777 |
| 2.151990967709013 | 0.82 | 1.123 | 1.783 |
| 2.155132560362603 | 0.819 | 1.124 | 1.79 |
| 2.158274153016193 | 0.819 | 1.125 | 1.797 |
| 2.161415745669782 | 0.818 | 1.125 | 1.803 |
| 2.164557338323372 | 0.817 | 1.126 | 1.81 |
| 2.167698930976961 | 0.816 | 1.127 | 1.817 |
| 2.170840523630551 | 0.816 | 1.127 | 1.824 |
| 2.173982116284141 | 0.815 | 1.128 | 1.831 |
| 2.17712370893773 | 0.814 | 1.129 | 1.838 |
| 2.18026530159132 | 0.814 | 1.129 | 1.845 |
| 2.183406894244909 | 0.813 | 1.13 | 1.852 |
| 2.186548486898499 | 0.812 | 1.131 | 1.859 |
| 2.189690079552089 | 0.812 | 1.131 | 1.866 |
| 2.192831672205678 | 0.811 | 1.132 | 1.873 |
| 2.195973264859268 | 0.81 | 1.133 | 1.88 |
| 2.199114857512857 | 0.81 | 1.133 | 1.888 |
| 2.202256450166447 | 0.809 | 1.134 | 1.895 |
| 2.205398042820036 | 0.808 | 1.135 | 1.902 |
| 2.208539635473626 | 0.808 | 1.135 | 1.91 |
| 2.211681228127216 | 0.807 | 1.136 | 1.917 |
| 2.214822820780805 | 0.806 | 1.136 | 1.924 |
| 2.217964413434395 | 0.806 | 1.137 | 1.932 |
| 2.221106006087984 | 0.805 | 1.138 | 1.939 |
| 2.224247598741574 | 0.804 | 1.138 | 1.947 |
| 2.227389191395164 | 0.804 | 1.139 | 1.954 |
| 2.230530784048753 | 0.803 | 1.14 | 1.962 |
| 2.233672376702343 | 0.802 | 1.14 | 1.97 |
| 2.236813969355933 | 0.802 | 1.141 | 1.977 |
| 2.239955562009522 | 0.801 | 1.142 | 1.985 |
| 2.243097154663112 | 0.801 | 1.142 | 1.993 |
| 2.246238747316701 | 0.8 | 1.143 | 2.001 |
| 2.249380339970291 | 0.799 | 1.144 | 2.009 |
| 2.252521932623881 | 0.799 | 1.144 | 2.017 |
| 2.25566352527747 | 0.798 | 1.145 | 2.025 |
| 2.25880511793106 | 0.797 | 1.145 | 2.033 |
| 2.261946710584649 | 0.797 | 1.146 | 2.041 |
| 2.265088303238239 | 0.796 | 1.147 | 2.049 |
| 2.268229895891829 | 0.796 | 1.147 | 2.057 |
| 2.271371488545418 | 0.795 | 1.148 | 2.065 |
| 2.274513081199008 | 0.794 | 1.149 | 2.073 |
| 2.277654673852597 | 0.794 | 1.149 | 2.081 |
| 2.280796266506186 | 0.793 | 1.15 | 2.09 |
| 2.283937859159776 | 0.793 | 1.151 | 2.098 |
| 2.287079451813366 | 0.792 | 1.151 | 2.106 |
| 2.290221044466955 | 0.791 | 1.152 | 2.115 |
| 2.293362637120545 | 0.791 | 1.152 | 2.123 |
| 2.296504229774135 | 0.79 | 1.153 | 2.132 |
| 2.299645822427724 | 0.79 | 1.154 | 2.14 |
| 2.302787415081314 | 0.789 | 1.154 | 2.149 |
| 2.305929007734904 | 0.788 | 1.155 | 2.158 |
| 2.309070600388493 | 0.788 | 1.156 | 2.166 |
| 2.312212193042083 | 0.787 | 1.156 | 2.175 |
| 2.315353785695672 | 0.787 | 1.157 | 2.184 |
| 2.318495378349262 | 0.786 | 1.157 | 2.193 |
| 2.321636971002852 | 0.786 | 1.158 | 2.202 |
| 2.324778563656441 | 0.785 | 1.159 | 2.211 |
| 2.327920156310031 | 0.784 | 1.159 | 2.22 |
| 2.33106174896362 | 0.784 | 1.16 | 2.229 |
| 2.33420334161721 | 0.783 | 1.16 | 2.238 |
| 2.3373449342708 | 0.783 | 1.161 | 2.247 |
| 2.340486526924389 | 0.782 | 1.162 | 2.256 |
| 2.343628119577979 | 0.782 | 1.162 | 2.265 |
| 2.346769712231568 | 0.781 | 1.163 | 2.274 |
| 2.349911304885158 | 0.781 | 1.164 | 2.284 |
| 2.353052897538748 | 0.78 | 1.164 | 2.293 |
| 2.356194490192337 | 0.78 | 1.165 | 2.302 |
| 2.359336082845927 | 0.779 | 1.165 | 2.312 |
| 2.362477675499516 | 0.778 | 1.166 | 2.321 |
| 2.365619268153106 | 0.778 | 1.167 | 2.331 |
| 2.368760860806696 | 0.777 | 1.167 | 2.341 |
| 2.371902453460285 | 0.777 | 1.168 | 2.35 |
| 2.375044046113875 | 0.776 | 1.168 | 2.36 |
| 2.378185638767464 | 0.776 | 1.169 | 2.37 |
| 2.381327231421054 | 0.775 | 1.169 | 2.379 |
| 2.384468824074644 | 0.775 | 1.17 | 2.389 |
| 2.387610416728233 | 0.774 | 1.171 | 2.399 |
| 2.390752009381823 | 0.774 | 1.171 | 2.409 |
| 2.393893602035412 | 0.773 | 1.172 | 2.419 |
| 2.397035194689002 | 0.773 | 1.172 | 2.429 |
| 2.400176787342591 | 0.772 | 1.173 | 2.439 |
| 2.403318379996181 | 0.772 | 1.174 | 2.449 |
| 2.406459972649771 | 0.771 | 1.174 | 2.459 |
| 2.40960156530336 | 0.771 | 1.175 | 2.47 |
| 2.41274315795695 | 0.77 | 1.175 | 2.48 |
| 2.41588475061054 | 0.77 | 1.176 | 2.49 |
| 2.419026343264129 | 0.769 | 1.177 | 2.501 |
| 2.422167935917719 | 0.769 | 1.177 | 2.511 |
| 2.425309528571308 | 0.768 | 1.178 | 2.521 |
| 2.428451121224898 | 0.768 | 1.178 | 2.532 |
| 2.431592713878488 | 0.767 | 1.179 | 2.543 |
| 2.434734306532077 | 0.767 | 1.179 | 2.553 |
| 2.437875899185667 | 0.766 | 1.18 | 2.564 |
| 2.441017491839256 | 0.766 | 1.18 | 2.575 |
| 2.444159084492846 | 0.765 | 1.181 | 2.585 |
| 2.447300677146435 | 0.765 | 1.182 | 2.596 |
| 2.450442269800025 | 0.764 | 1.182 | 2.607 |
| 2.453583862453615 | 0.764 | 1.183 | 2.618 |
| 2.456725455107204 | 0.763 | 1.183 | 2.629 |
| 2.459867047760794 | 0.763 | 1.184 | 2.64 |
| 2.463008640414384 | 0.763 | 1.184 | 2.651 |
| 2.466150233067973 | 0.762 | 1.185 | 2.662 |
| 2.469291825721563 | 0.762 | 1.186 | 2.673 |
| 2.472433418375152 | 0.761 | 1.186 | 2.684 |
| 2.475575011028742 | 0.761 | 1.187 | 2.696 |
| 2.478716603682332 | 0.76 | 1.187 | 2.707 |
| 2.481858196335921 | 0.76 | 1.188 | 2.718 |
| 2.48499978898951 | 0.759 | 1.188 | 2.73 |
| 2.4881413816431 | 0.759 | 1.189 | 2.741 |
| 2.49128297429669 | 0.759 | 1.189 | 2.753 |
| 2.49442456695028 | 0.758 | 1.19 | 2.764 |
| 2.497566159603869 | 0.758 | 1.19 | 2.776 |
| 2.500707752257458 | 0.757 | 1.191 | 2.787 |
| 2.503849344911048 | 0.757 | 1.191 | 2.799 |
| 2.506990937564638 | 0.756 | 1.192 | 2.811 |
| 2.510132530218228 | 0.756 | 1.193 | 2.823 |
| 2.513274122871817 | 0.756 | 1.193 | 2.835 |
| 2.516415715525407 | 0.755 | 1.194 | 2.846 |
| 2.519557308178996 | 0.755 | 1.194 | 2.858 |
| 2.522698900832586 | 0.754 | 1.195 | 2.87 |
| 2.525840493486176 | 0.754 | 1.195 | 2.882 |
| 2.528982086139765 | 0.753 | 1.196 | 2.895 |
| 2.532123678793355 | 0.753 | 1.196 | 2.907 |
| 2.535265271446944 | 0.753 | 1.197 | 2.919 |
| 2.538406864100534 | 0.752 | 1.197 | 2.931 |
| 2.541548456754124 | 0.752 | 1.198 | 2.943 |
| 2.544690049407713 | 0.751 | 1.198 | 2.956 |
| 2.547831642061302 | 0.751 | 1.199 | 2.968 |
| 2.550973234714892 | 0.751 | 1.199 | 2.98 |
| 2.554114827368482 | 0.75 | 1.2 | 2.993 |
| 2.557256420022072 | 0.75 | 1.2 | 3.005 |
| 2.560398012675661 | 0.749 | 1.201 | 3.018 |
| 2.563539605329251 | 0.749 | 1.201 | 3.031 |
| 2.56668119798284 | 0.749 | 1.202 | 3.043 |
| 2.56982279063643 | 0.748 | 1.202 | 3.056 |
| 2.57296438329002 | 0.748 | 1.203 | 3.069 |
| 2.576105975943609 | 0.748 | 1.203 | 3.081 |
| 2.579247568597199 | 0.747 | 1.204 | 3.094 |
| 2.582389161250788 | 0.747 | 1.204 | 3.107 |
| 2.585530753904377 | 0.746 | 1.205 | 3.12 |
| 2.588672346557967 | 0.746 | 1.205 | 3.133 |
| 2.591813939211557 | 0.746 | 1.206 | 3.146 |
| 2.594955531865147 | 0.745 | 1.206 | 3.159 |
| 2.598097124518736 | 0.745 | 1.207 | 3.172 |
| 2.601238717172326 | 0.745 | 1.207 | 3.185 |
| 2.604380309825915 | 0.744 | 1.207 | 3.198 |
| 2.607521902479505 | 0.744 | 1.208 | 3.211 |
| 2.610663495133095 | 0.744 | 1.208 | 3.224 |
| 2.613805087786684 | 0.743 | 1.209 | 3.238 |
| 2.616946680440274 | 0.743 | 1.209 | 3.251 |
| 2.620088273093863 | 0.742 | 1.21 | 3.264 |
| 2.623229865747452 | 0.742 | 1.21 | 3.278 |
| 2.626371458401042 | 0.742 | 1.211 | 3.291 |
| 2.629513051054632 | 0.741 | 1.211 | 3.304 |
| 2.632654643708222 | 0.741 | 1.212 | 3.318 |
| 2.635796236361811 | 0.741 | 1.212 | 3.331 |
| 2.638937829015401 | 0.74 | 1.213 | 3.345 |
| 2.642079421668991 | 0.74 | 1.213 | 3.359 |
| 2.64522101432258 | 0.74 | 1.213 | 3.372 |
| 2.64836260697617 | 0.739 | 1.214 | 3.386 |
| 2.651504199629759 | 0.739 | 1.214 | 3.399 |
| 2.654645792283349 | 0.739 | 1.215 | 3.413 |
| 2.657787384936938 | 0.739 | 1.215 | 3.427 |
| 2.660928977590528 | 0.738 | 1.216 | 3.441 |
| 2.664070570244118 | 0.738 | 1.216 | 3.454 |
| 2.667212162897707 | 0.738 | 1.216 | 3.468 |
| 2.670353755551297 | 0.737 | 1.217 | 3.482 |
| 2.673495348204887 | 0.737 | 1.217 | 3.496 |
| 2.676636940858476 | 0.737 | 1.218 | 3.51 |
| 2.679778533512066 | 0.736 | 1.218 | 3.524 |
| 2.682920126165655 | 0.736 | 1.219 | 3.537 |
| 2.686061718819245 | 0.736 | 1.219 | 3.551 |
| 2.689203311472835 | 0.735 | 1.219 | 3.565 |
| 2.692344904126424 | 0.735 | 1.22 | 3.579 |
| 2.695486496780014 | 0.735 | 1.22 | 3.593 |
| 2.698628089433603 | 0.735 | 1.221 | 3.607 |
| 2.701769682087193 | 0.734 | 1.221 | 3.621 |
| 2.704911274740782 | 0.734 | 1.221 | 3.635 |
| 2.708052867394372 | 0.734 | 1.222 | 3.649 |
| 2.711194460047962 | 0.733 | 1.222 | 3.664 |
| 2.714336052701551 | 0.733 | 1.223 | 3.678 |
| 2.717477645355141 | 0.733 | 1.223 | 3.692 |
| 2.720619238008731 | 0.733 | 1.223 | 3.706 |
| 2.72376083066232 | 0.732 | 1.224 | 3.72 |
| 2.72690242331591 | 0.732 | 1.224 | 3.734 |
| 2.730044015969499 | 0.732 | 1.224 | 3.748 |
| 2.733185608623089 | 0.731 | 1.225 | 3.762 |
| 2.736327201276678 | 0.731 | 1.225 | 3.776 |
| 2.739468793930268 | 0.731 | 1.226 | 3.791 |
| 2.742610386583858 | 0.731 | 1.226 | 3.805 |
| 2.745751979237447 | 0.73 | 1.226 | 3.819 |
| 2.748893571891036 | 0.73 | 1.227 | 3.833 |
| 2.752035164544627 | 0.73 | 1.227 | 3.847 |
| 2.755176757198216 | 0.73 | 1.227 | 3.861 |
| 2.758318349851806 | 0.729 | 1.228 | 3.875 |
| 2.761459942505395 | 0.729 | 1.228 | 3.889 |
| 2.764601535158985 | 0.729 | 1.228 | 3.904 |
| 2.767743127812574 | 0.729 | 1.229 | 3.918 |
| 2.770884720466164 | 0.728 | 1.229 | 3.932 |
| 2.774026313119754 | 0.728 | 1.229 | 3.946 |
| 2.777167905773343 | 0.728 | 1.23 | 3.96 |
| 2.780309498426932 | 0.728 | 1.23 | 3.974 |
| 2.783451091080522 | 0.727 | 1.23 | 3.988 |
| 2.786592683734112 | 0.727 | 1.231 | 4.002 |
| 2.789734276387701 | 0.727 | 1.231 | 4.016 |
| 2.792875869041291 | 0.727 | 1.231 | 4.03 |
| 2.796017461694881 | 0.727 | 1.232 | 4.044 |
| 2.79915905434847 | 0.726 | 1.232 | 4.058 |
| 2.80230064700206 | 0.726 | 1.232 | 4.072 |
| 2.80544223965565 | 0.726 | 1.233 | 4.085 |
| 2.808583832309239 | 0.726 | 1.233 | 4.099 |
| 2.811725424962829 | 0.725 | 1.233 | 4.113 |
| 2.814867017616419 | 0.725 | 1.234 | 4.127 |
| 2.818008610270008 | 0.725 | 1.234 | 4.14 |
| 2.821150202923598 | 0.725 | 1.234 | 4.154 |
| 2.824291795577187 | 0.725 | 1.235 | 4.168 |
| 2.827433388230777 | 0.724 | 1.235 | 4.181 |
| 2.830574980884366 | 0.724 | 1.235 | 4.195 |
| 2.833716573537956 | 0.724 | 1.235 | 4.208 |
| 2.836858166191546 | 0.724 | 1.236 | 4.222 |
| 2.839999758845135 | 0.724 | 1.236 | 4.235 |
| 2.843141351498725 | 0.723 | 1.236 | 4.249 |
| 2.846282944152314 | 0.723 | 1.237 | 4.262 |
| 2.849424536805904 | 0.723 | 1.237 | 4.275 |
| 2.852566129459494 | 0.723 | 1.237 | 4.288 |
| 2.855707722113083 | 0.723 | 1.237 | 4.302 |
| 2.858849314766673 | 0.722 | 1.238 | 4.315 |
| 2.861990907420262 | 0.722 | 1.238 | 4.328 |
| 2.865132500073852 | 0.722 | 1.238 | 4.341 |
| 2.868274092727442 | 0.722 | 1.239 | 4.354 |
| 2.871415685381031 | 0.722 | 1.239 | 4.366 |
| 2.874557278034621 | 0.722 | 1.239 | 4.379 |
| 2.87769887068821 | 0.721 | 1.239 | 4.392 |
| 2.8808404633418 | 0.721 | 1.24 | 4.404 |
| 2.88398205599539 | 0.721 | 1.24 | 4.417 |
| 2.88712364864898 | 0.721 | 1.24 | 4.429 |
| 2.890265241302569 | 0.721 | 1.24 | 4.442 |
| 2.893406833956158 | 0.721 | 1.24 | 4.454 |
| 2.896548426609748 | 0.72 | 1.241 | 4.466 |
| 2.899690019263338 | 0.72 | 1.241 | 4.478 |
| 2.902831611916927 | 0.72 | 1.241 | 4.49 |
| 2.905973204570517 | 0.72 | 1.241 | 4.502 |
| 2.909114797224106 | 0.72 | 1.242 | 4.514 |
| 2.912256389877696 | 0.72 | 1.242 | 4.526 |
| 2.915397982531286 | 0.72 | 1.242 | 4.538 |
| 2.918539575184875 | 0.719 | 1.242 | 4.549 |
| 2.921681167838465 | 0.719 | 1.243 | 4.561 |
| 2.924822760492054 | 0.719 | 1.243 | 4.572 |
| 2.927964353145644 | 0.719 | 1.243 | 4.583 |
| 2.931105945799234 | 0.719 | 1.243 | 4.594 |
| 2.934247538452823 | 0.719 | 1.243 | 4.605 |
| 2.937389131106413 | 0.719 | 1.244 | 4.616 |
| 2.940530723760002 | 0.718 | 1.244 | 4.627 |
| 2.943672316413592 | 0.718 | 1.244 | 4.638 |
| 2.946813909067182 | 0.718 | 1.244 | 4.648 |
| 2.949955501720771 | 0.718 | 1.244 | 4.659 |
| 2.953097094374361 | 0.718 | 1.244 | 4.669 |
| 2.95623868702795 | 0.718 | 1.245 | 4.679 |
| 2.95938027968154 | 0.718 | 1.245 | 4.689 |
| 2.96252187233513 | 0.718 | 1.245 | 4.699 |
| 2.965663464988719 | 0.717 | 1.245 | 4.709 |
| 2.968805057642309 | 0.717 | 1.245 | 4.719 |
| 2.971946650295898 | 0.717 | 1.246 | 4.728 |
| 2.975088242949488 | 0.717 | 1.246 | 4.738 |
| 2.978229835603078 | 0.717 | 1.246 | 4.747 |
| 2.981371428256667 | 0.717 | 1.246 | 4.756 |
| 2.984513020910257 | 0.717 | 1.246 | 4.765 |
| 2.987654613563846 | 0.717 | 1.246 | 4.774 |
| 2.990796206217436 | 0.717 | 1.246 | 4.783 |
| 2.993937798871025 | 0.717 | 1.247 | 4.791 |
| 2.997079391524615 | 0.716 | 1.247 | 4.8 |
| 3.000220984178205 | 0.716 | 1.247 | 4.808 |
| 3.003362576831794 | 0.716 | 1.247 | 4.816 |
| 3.006504169485384 | 0.716 | 1.247 | 4.824 |
| 3.009645762138974 | 0.716 | 1.247 | 4.832 |
| 3.012787354792563 | 0.716 | 1.247 | 4.84 |
| 3.015928947446153 | 0.716 | 1.248 | 4.847 |
| 3.019070540099742 | 0.716 | 1.248 | 4.854 |
| 3.022212132753332 | 0.716 | 1.248 | 4.862 |
| 3.025353725406922 | 0.716 | 1.248 | 4.869 |
| 3.028495318060511 | 0.716 | 1.248 | 4.875 |
| 3.031636910714101 | 0.716 | 1.248 | 4.882 |
| 3.03477850336769 | 0.715 | 1.248 | 4.889 |
| 3.03792009602128 | 0.715 | 1.248 | 4.895 |
| 3.04106168867487 | 0.715 | 1.248 | 4.901 |
| 3.04420328132846 | 0.715 | 1.249 | 4.907 |
| 3.047344873982049 | 0.715 | 1.249 | 4.913 |
| 3.050486466635638 | 0.715 | 1.249 | 4.918 |
| 3.053628059289228 | 0.715 | 1.249 | 4.924 |
| 3.056769651942818 | 0.715 | 1.249 | 4.929 |
| 3.059911244596407 | 0.715 | 1.249 | 4.934 |
| 3.063052837249997 | 0.715 | 1.249 | 4.939 |
| 3.066194429903586 | 0.715 | 1.249 | 4.944 |
| 3.069336022557176 | 0.715 | 1.249 | 4.948 |
| 3.072477615210766 | 0.715 | 1.249 | 4.953 |
| 3.075619207864355 | 0.715 | 1.249 | 4.957 |
| 3.078760800517945 | 0.715 | 1.249 | 4.961 |
| 3.081902393171534 | 0.715 | 1.249 | 4.965 |
| 3.085043985825124 | 0.715 | 1.25 | 4.968 |
| 3.088185578478713 | 0.715 | 1.25 | 4.972 |
| 3.091327171132303 | 0.715 | 1.25 | 4.975 |
| 3.094468763785893 | 0.715 | 1.25 | 4.978 |
| 3.097610356439482 | 0.714 | 1.25 | 4.981 |
| 3.100751949093072 | 0.714 | 1.25 | 4.983 |
| 3.103893541746661 | 0.714 | 1.25 | 4.986 |
| 3.107035134400251 | 0.714 | 1.25 | 4.988 |
| 3.110176727053841 | 0.714 | 1.25 | 4.99 |
| 3.11331831970743 | 0.714 | 1.25 | 4.992 |
| 3.11645991236102 | 0.714 | 1.25 | 4.994 |
| 3.11960150501461 | 0.714 | 1.25 | 4.995 |
| 3.122743097668199 | 0.714 | 1.25 | 4.996 |
| 3.125884690321789 | 0.714 | 1.25 | 4.998 |
| 3.129026282975378 | 0.714 | 1.25 | 4.998 |
| 3.132167875628968 | 0.714 | 1.25 | 4.999 |
| 3.135309468282557 | 0.714 | 1.25 | 5 |
| 3.138451060936147 | 0.714 | 1.25 | 5 |
| 3.141592653589737 | 0.714 | 1.25 | 5 |
| 3.144734246243326 | 0.714 | 1.25 | 5 |
| 3.147875838896916 | 0.714 | 1.25 | 5 |
| 3.151017431550505 | 0.714 | 1.25 | 4.999 |
| 3.154159024204095 | 0.714 | 1.25 | 4.998 |
| 3.157300616857685 | 0.714 | 1.25 | 4.998 |
| 3.160442209511274 | 0.714 | 1.25 | 4.996 |
| 3.163583802164864 | 0.714 | 1.25 | 4.995 |
| 3.166725394818453 | 0.714 | 1.25 | 4.994 |
| 3.169866987472043 | 0.714 | 1.25 | 4.992 |
| 3.173008580125633 | 0.714 | 1.25 | 4.99 |
| 3.176150172779222 | 0.714 | 1.25 | 4.988 |
| 3.179291765432812 | 0.714 | 1.25 | 4.986 |
| 3.182433358086401 | 0.714 | 1.25 | 4.983 |
| 3.185574950739991 | 0.714 | 1.25 | 4.981 |
| 3.188716543393581 | 0.715 | 1.25 | 4.978 |
| 3.19185813604717 | 0.715 | 1.25 | 4.975 |
| 3.19499972870076 | 0.715 | 1.25 | 4.972 |
| 3.198141321354349 | 0.715 | 1.25 | 4.968 |
| 3.20128291400794 | 0.715 | 1.249 | 4.965 |
| 3.204424506661528 | 0.715 | 1.249 | 4.961 |
| 3.207566099315118 | 0.715 | 1.249 | 4.957 |
| 3.210707691968708 | 0.715 | 1.249 | 4.953 |
| 3.213849284622297 | 0.715 | 1.249 | 4.948 |
| 3.216990877275887 | 0.715 | 1.249 | 4.944 |
| 3.220132469929476 | 0.715 | 1.249 | 4.939 |
| 3.223274062583066 | 0.715 | 1.249 | 4.934 |
| 3.226415655236656 | 0.715 | 1.249 | 4.929 |
| 3.229557247890245 | 0.715 | 1.249 | 4.924 |
| 3.232698840543835 | 0.715 | 1.249 | 4.918 |
| 3.235840433197425 | 0.715 | 1.249 | 4.913 |
| 3.238982025851014 | 0.715 | 1.249 | 4.907 |
| 3.242123618504604 | 0.715 | 1.248 | 4.901 |
| 3.245265211158193 | 0.715 | 1.248 | 4.895 |
| 3.248406803811783 | 0.715 | 1.248 | 4.889 |
| 3.251548396465373 | 0.716 | 1.248 | 4.882 |
| 3.254689989118962 | 0.716 | 1.248 | 4.875 |
| 3.257831581772551 | 0.716 | 1.248 | 4.869 |
| 3.260973174426141 | 0.716 | 1.248 | 4.862 |
| 3.26411476707973 | 0.716 | 1.248 | 4.854 |
| 3.267256359733321 | 0.716 | 1.248 | 4.847 |
| 3.27039795238691 | 0.716 | 1.247 | 4.84 |
| 3.2735395450405 | 0.716 | 1.247 | 4.832 |
| 3.276681137694089 | 0.716 | 1.247 | 4.824 |
| 3.279822730347679 | 0.716 | 1.247 | 4.816 |
| 3.282964323001269 | 0.716 | 1.247 | 4.808 |
| 3.286105915654858 | 0.716 | 1.247 | 4.8 |
| 3.289247508308448 | 0.717 | 1.247 | 4.791 |
| 3.292389100962037 | 0.717 | 1.246 | 4.783 |
| 3.295530693615627 | 0.717 | 1.246 | 4.774 |
| 3.298672286269217 | 0.717 | 1.246 | 4.765 |
| 3.301813878922806 | 0.717 | 1.246 | 4.756 |
| 3.304955471576396 | 0.717 | 1.246 | 4.747 |
| 3.308097064229985 | 0.717 | 1.246 | 4.738 |
| 3.311238656883575 | 0.717 | 1.246 | 4.728 |
| 3.314380249537165 | 0.717 | 1.245 | 4.719 |
| 3.317521842190754 | 0.717 | 1.245 | 4.709 |
| 3.320663434844344 | 0.718 | 1.245 | 4.699 |
| 3.323805027497933 | 0.718 | 1.245 | 4.689 |
| 3.326946620151523 | 0.718 | 1.245 | 4.679 |
| 3.330088212805113 | 0.718 | 1.244 | 4.669 |
| 3.333229805458702 | 0.718 | 1.244 | 4.659 |
| 3.336371398112292 | 0.718 | 1.244 | 4.648 |
| 3.339512990765881 | 0.718 | 1.244 | 4.638 |
| 3.342654583419471 | 0.718 | 1.244 | 4.627 |
| 3.345796176073061 | 0.719 | 1.244 | 4.616 |
| 3.34893776872665 | 0.719 | 1.243 | 4.605 |
| 3.35207936138024 | 0.719 | 1.243 | 4.594 |
| 3.355220954033829 | 0.719 | 1.243 | 4.583 |
| 3.358362546687419 | 0.719 | 1.243 | 4.572 |
| 3.361504139341009 | 0.719 | 1.243 | 4.561 |
| 3.364645731994598 | 0.719 | 1.242 | 4.549 |
| 3.367787324648188 | 0.72 | 1.242 | 4.538 |
| 3.370928917301777 | 0.72 | 1.242 | 4.526 |
| 3.374070509955367 | 0.72 | 1.242 | 4.514 |
| 3.377212102608956 | 0.72 | 1.241 | 4.502 |
| 3.380353695262546 | 0.72 | 1.241 | 4.49 |
| 3.383495287916136 | 0.72 | 1.241 | 4.478 |
| 3.386636880569725 | 0.72 | 1.241 | 4.466 |
| 3.389778473223315 | 0.721 | 1.24 | 4.454 |
| 3.392920065876904 | 0.721 | 1.24 | 4.442 |
| 3.396061658530494 | 0.721 | 1.24 | 4.429 |
| 3.399203251184084 | 0.721 | 1.24 | 4.417 |
| 3.402344843837673 | 0.721 | 1.24 | 4.404 |
| 3.405486436491263 | 0.721 | 1.239 | 4.392 |
| 3.408628029144852 | 0.722 | 1.239 | 4.379 |
| 3.411769621798442 | 0.722 | 1.239 | 4.366 |
| 3.414911214452032 | 0.722 | 1.239 | 4.354 |
| 3.418052807105621 | 0.722 | 1.238 | 4.341 |
| 3.421194399759211 | 0.722 | 1.238 | 4.328 |
| 3.4243359924128 | 0.722 | 1.238 | 4.315 |
| 3.42747758506639 | 0.723 | 1.237 | 4.302 |
| 3.43061917771998 | 0.723 | 1.237 | 4.288 |
| 3.433760770373569 | 0.723 | 1.237 | 4.275 |
| 3.436902363027159 | 0.723 | 1.237 | 4.262 |
| 3.440043955680748 | 0.723 | 1.236 | 4.249 |
| 3.443185548334338 | 0.724 | 1.236 | 4.235 |
| 3.446327140987927 | 0.724 | 1.236 | 4.222 |
| 3.449468733641517 | 0.724 | 1.235 | 4.208 |
| 3.452610326295107 | 0.724 | 1.235 | 4.195 |
| 3.455751918948696 | 0.724 | 1.235 | 4.181 |
| 3.458893511602286 | 0.725 | 1.235 | 4.168 |
| 3.462035104255876 | 0.725 | 1.234 | 4.154 |
| 3.465176696909465 | 0.725 | 1.234 | 4.14 |
| 3.468318289563055 | 0.725 | 1.234 | 4.127 |
| 3.471459882216644 | 0.725 | 1.233 | 4.113 |
| 3.474601474870234 | 0.726 | 1.233 | 4.099 |
| 3.477743067523824 | 0.726 | 1.233 | 4.085 |
| 3.480884660177413 | 0.726 | 1.232 | 4.072 |
| 3.484026252831002 | 0.726 | 1.232 | 4.058 |
| 3.487167845484592 | 0.727 | 1.232 | 4.044 |
| 3.490309438138182 | 0.727 | 1.231 | 4.03 |
| 3.493451030791772 | 0.727 | 1.231 | 4.016 |
| 3.496592623445361 | 0.727 | 1.231 | 4.002 |
| 3.499734216098951 | 0.727 | 1.23 | 3.988 |
| 3.50287580875254 | 0.728 | 1.23 | 3.974 |
| 3.50601740140613 | 0.728 | 1.23 | 3.96 |
| 3.50915899405972 | 0.728 | 1.229 | 3.946 |
| 3.512300586713309 | 0.728 | 1.229 | 3.932 |
| 3.515442179366899 | 0.729 | 1.229 | 3.918 |
| 3.518583772020488 | 0.729 | 1.228 | 3.904 |
| 3.521725364674078 | 0.729 | 1.228 | 3.889 |
| 3.524866957327668 | 0.729 | 1.228 | 3.875 |
| 3.528008549981257 | 0.73 | 1.227 | 3.861 |
| 3.531150142634847 | 0.73 | 1.227 | 3.847 |
| 3.534291735288436 | 0.73 | 1.227 | 3.833 |
| 3.537433327942026 | 0.73 | 1.226 | 3.819 |
| 3.540574920595616 | 0.731 | 1.226 | 3.805 |
| 3.543716513249205 | 0.731 | 1.226 | 3.791 |
| 3.546858105902795 | 0.731 | 1.225 | 3.776 |
| 3.549999698556384 | 0.731 | 1.225 | 3.762 |
| 3.553141291209974 | 0.732 | 1.224 | 3.748 |
| 3.556282883863564 | 0.732 | 1.224 | 3.734 |
| 3.559424476517153 | 0.732 | 1.224 | 3.72 |
| 3.562566069170743 | 0.733 | 1.223 | 3.706 |
| 3.565707661824332 | 0.733 | 1.223 | 3.692 |
| 3.568849254477922 | 0.733 | 1.223 | 3.678 |
| 3.571990847131511 | 0.733 | 1.222 | 3.664 |
| 3.575132439785101 | 0.734 | 1.222 | 3.649 |
| 3.578274032438691 | 0.734 | 1.221 | 3.635 |
| 3.58141562509228 | 0.734 | 1.221 | 3.621 |
| 3.58455721774587 | 0.735 | 1.221 | 3.607 |
| 3.58769881039946 | 0.735 | 1.22 | 3.593 |
| 3.590840403053049 | 0.735 | 1.22 | 3.579 |
| 3.593981995706639 | 0.735 | 1.219 | 3.565 |
| 3.597123588360228 | 0.736 | 1.219 | 3.551 |
| 3.600265181013818 | 0.736 | 1.219 | 3.537 |
| 3.603406773667407 | 0.736 | 1.218 | 3.524 |
| 3.606548366320997 | 0.737 | 1.218 | 3.51 |
| 3.609689958974587 | 0.737 | 1.217 | 3.496 |
| 3.612831551628176 | 0.737 | 1.217 | 3.482 |
| 3.615973144281766 | 0.738 | 1.216 | 3.468 |
| 3.619114736935355 | 0.738 | 1.216 | 3.454 |
| 3.622256329588945 | 0.738 | 1.216 | 3.441 |
| 3.625397922242534 | 0.739 | 1.215 | 3.427 |
| 3.628539514896124 | 0.739 | 1.215 | 3.413 |
| 3.631681107549714 | 0.739 | 1.214 | 3.399 |
| 3.634822700203303 | 0.739 | 1.214 | 3.386 |
| 3.637964292856893 | 0.74 | 1.213 | 3.372 |
| 3.641105885510483 | 0.74 | 1.213 | 3.359 |
| 3.644247478164072 | 0.74 | 1.213 | 3.345 |
| 3.647389070817662 | 0.741 | 1.212 | 3.331 |
| 3.650530663471251 | 0.741 | 1.212 | 3.318 |
| 3.653672256124841 | 0.741 | 1.211 | 3.304 |
| 3.656813848778431 | 0.742 | 1.211 | 3.291 |
| 3.65995544143202 | 0.742 | 1.21 | 3.278 |
| 3.66309703408561 | 0.742 | 1.21 | 3.264 |
| 3.666238626739199 | 0.743 | 1.209 | 3.251 |
| 3.66938021939279 | 0.743 | 1.209 | 3.238 |
| 3.672521812046378 | 0.744 | 1.208 | 3.224 |
| 3.675663404699968 | 0.744 | 1.208 | 3.211 |
| 3.678804997353558 | 0.744 | 1.207 | 3.198 |
| 3.681946590007147 | 0.745 | 1.207 | 3.185 |
| 3.685088182660737 | 0.745 | 1.207 | 3.172 |
| 3.688229775314326 | 0.745 | 1.206 | 3.159 |
| 3.691371367967916 | 0.746 | 1.206 | 3.146 |
| 3.694512960621506 | 0.746 | 1.205 | 3.133 |
| 3.697654553275095 | 0.746 | 1.205 | 3.12 |
| 3.700796145928685 | 0.747 | 1.204 | 3.107 |
| 3.703937738582274 | 0.747 | 1.204 | 3.094 |
| 3.707079331235864 | 0.748 | 1.203 | 3.081 |
| 3.710220923889454 | 0.748 | 1.203 | 3.069 |
| 3.713362516543043 | 0.748 | 1.202 | 3.056 |
| 3.716504109196633 | 0.749 | 1.202 | 3.043 |
| 3.719645701850223 | 0.749 | 1.201 | 3.031 |
| 3.722787294503812 | 0.749 | 1.201 | 3.018 |
| 3.725928887157402 | 0.75 | 1.2 | 3.005 |
| 3.729070479810991 | 0.75 | 1.2 | 2.993 |
| 3.732212072464581 | 0.751 | 1.199 | 2.98 |
| 3.735353665118171 | 0.751 | 1.199 | 2.968 |
| 3.73849525777176 | 0.751 | 1.198 | 2.956 |
| 3.74163685042535 | 0.752 | 1.198 | 2.943 |
| 3.744778443078939 | 0.752 | 1.197 | 2.931 |
| 3.747920035732529 | 0.753 | 1.197 | 2.919 |
| 3.751061628386119 | 0.753 | 1.196 | 2.907 |
| 3.754203221039708 | 0.753 | 1.196 | 2.895 |
| 3.757344813693298 | 0.754 | 1.195 | 2.882 |
| 3.760486406346887 | 0.754 | 1.195 | 2.87 |
| 3.763627999000477 | 0.755 | 1.194 | 2.858 |
| 3.766769591654067 | 0.755 | 1.194 | 2.846 |
| 3.769911184307656 | 0.756 | 1.193 | 2.835 |
| 3.773052776961246 | 0.756 | 1.193 | 2.823 |
| 3.776194369614835 | 0.756 | 1.192 | 2.811 |
| 3.779335962268425 | 0.757 | 1.191 | 2.799 |
| 3.782477554922014 | 0.757 | 1.191 | 2.787 |
| 3.785619147575604 | 0.758 | 1.19 | 2.776 |
| 3.788760740229193 | 0.758 | 1.19 | 2.764 |
| 3.791902332882783 | 0.759 | 1.189 | 2.753 |
| 3.795043925536373 | 0.759 | 1.189 | 2.741 |
| 3.798185518189962 | 0.759 | 1.188 | 2.73 |
| 3.801327110843552 | 0.76 | 1.188 | 2.718 |
| 3.804468703497142 | 0.76 | 1.187 | 2.707 |
| 3.807610296150731 | 0.761 | 1.187 | 2.696 |
| 3.810751888804321 | 0.761 | 1.186 | 2.684 |
| 3.813893481457911 | 0.762 | 1.186 | 2.673 |
| 3.8170350741115 | 0.762 | 1.185 | 2.662 |
| 3.82017666676509 | 0.763 | 1.184 | 2.651 |
| 3.823318259418679 | 0.763 | 1.184 | 2.64 |
| 3.826459852072269 | 0.763 | 1.183 | 2.629 |
| 3.829601444725859 | 0.764 | 1.183 | 2.618 |
| 3.832743037379448 | 0.764 | 1.182 | 2.607 |
| 3.835884630033038 | 0.765 | 1.182 | 2.596 |
| 3.839026222686627 | 0.765 | 1.181 | 2.585 |
| 3.842167815340217 | 0.766 | 1.18 | 2.575 |
| 3.845309407993807 | 0.766 | 1.18 | 2.564 |
| 3.848451000647396 | 0.767 | 1.179 | 2.553 |
| 3.851592593300986 | 0.767 | 1.179 | 2.543 |
| 3.854734185954575 | 0.768 | 1.178 | 2.532 |
| 3.857875778608165 | 0.768 | 1.178 | 2.521 |
| 3.861017371261755 | 0.769 | 1.177 | 2.511 |
| 3.864158963915344 | 0.769 | 1.177 | 2.501 |
| 3.867300556568933 | 0.77 | 1.176 | 2.49 |
| 3.870442149222523 | 0.77 | 1.175 | 2.48 |
| 3.873583741876112 | 0.771 | 1.175 | 2.47 |
| 3.876725334529703 | 0.771 | 1.174 | 2.459 |
| 3.879866927183292 | 0.772 | 1.174 | 2.449 |
| 3.883008519836882 | 0.772 | 1.173 | 2.439 |
| 3.886150112490471 | 0.773 | 1.172 | 2.429 |
| 3.889291705144061 | 0.773 | 1.172 | 2.419 |
| 3.892433297797651 | 0.774 | 1.171 | 2.409 |
| 3.89557489045124 | 0.774 | 1.171 | 2.399 |
| 3.89871648310483 | 0.775 | 1.17 | 2.389 |
| 3.901858075758419 | 0.775 | 1.169 | 2.379 |
| 3.904999668412009 | 0.776 | 1.169 | 2.37 |
| 3.908141261065598 | 0.776 | 1.168 | 2.36 |
| 3.911282853719188 | 0.777 | 1.168 | 2.35 |
| 3.914424446372778 | 0.777 | 1.167 | 2.341 |
| 3.917566039026367 | 0.778 | 1.167 | 2.331 |
| 3.920707631679957 | 0.778 | 1.166 | 2.321 |
| 3.923849224333547 | 0.779 | 1.165 | 2.312 |
| 3.926990816987136 | 0.78 | 1.165 | 2.302 |
| 3.930132409640726 | 0.78 | 1.164 | 2.293 |
| 3.933274002294315 | 0.781 | 1.164 | 2.284 |
| 3.936415594947905 | 0.781 | 1.163 | 2.274 |
| 3.939557187601495 | 0.782 | 1.162 | 2.265 |
| 3.942698780255084 | 0.782 | 1.162 | 2.256 |
| 3.945840372908674 | 0.783 | 1.161 | 2.247 |
| 3.948981965562263 | 0.783 | 1.16 | 2.238 |
| 3.952123558215853 | 0.784 | 1.16 | 2.229 |
| 3.955265150869442 | 0.784 | 1.159 | 2.22 |
| 3.958406743523032 | 0.785 | 1.159 | 2.211 |
| 3.961548336176622 | 0.786 | 1.158 | 2.202 |
| 3.964689928830211 | 0.786 | 1.157 | 2.193 |
| 3.967831521483801 | 0.787 | 1.157 | 2.184 |
| 3.97097311413739 | 0.787 | 1.156 | 2.175 |
| 3.97411470679098 | 0.788 | 1.156 | 2.166 |
| 3.97725629944457 | 0.788 | 1.155 | 2.158 |
| 3.98039789209816 | 0.789 | 1.154 | 2.149 |
| 3.983539484751749 | 0.79 | 1.154 | 2.14 |
| 3.986681077405338 | 0.79 | 1.153 | 2.132 |
| 3.989822670058928 | 0.791 | 1.152 | 2.123 |
| 3.992964262712517 | 0.791 | 1.152 | 2.115 |
| 3.996105855366107 | 0.792 | 1.151 | 2.106 |
| 3.999247448019697 | 0.793 | 1.151 | 2.098 |
| 4.002389040673287 | 0.793 | 1.15 | 2.09 |
| 4.005530633326877 | 0.794 | 1.149 | 2.081 |
| 4.008672225980466 | 0.794 | 1.149 | 2.073 |
| 4.011813818634056 | 0.795 | 1.148 | 2.065 |
| 4.014955411287645 | 0.796 | 1.147 | 2.057 |
| 4.018097003941234 | 0.796 | 1.147 | 2.049 |
| 4.021238596594824 | 0.797 | 1.146 | 2.041 |
| 4.024380189248414 | 0.797 | 1.145 | 2.033 |
| 4.027521781902004 | 0.798 | 1.145 | 2.025 |
| 4.030663374555593 | 0.799 | 1.144 | 2.017 |
| 4.033804967209183 | 0.799 | 1.144 | 2.009 |
| 4.036946559862773 | 0.8 | 1.143 | 2.001 |
| 4.040088152516362 | 0.801 | 1.142 | 1.993 |
| 4.043229745169951 | 0.801 | 1.142 | 1.985 |
| 4.046371337823541 | 0.802 | 1.141 | 1.977 |
| 4.049512930477131 | 0.802 | 1.14 | 1.97 |
| 4.05265452313072 | 0.803 | 1.14 | 1.962 |
| 4.05579611578431 | 0.804 | 1.139 | 1.954 |
| 4.0589377084379 | 0.804 | 1.138 | 1.947 |
| 4.062079301091489 | 0.805 | 1.138 | 1.939 |
| 4.065220893745079 | 0.806 | 1.137 | 1.932 |
| 4.068362486398668 | 0.806 | 1.136 | 1.924 |
| 4.071504079052258 | 0.807 | 1.136 | 1.917 |
| 4.074645671705848 | 0.808 | 1.135 | 1.91 |
| 4.077787264359437 | 0.808 | 1.135 | 1.902 |
| 4.080928857013027 | 0.809 | 1.134 | 1.895 |
| 4.084070449666616 | 0.81 | 1.133 | 1.888 |
| 4.087212042320206 | 0.81 | 1.133 | 1.88 |
| 4.090353634973795 | 0.811 | 1.132 | 1.873 |
| 4.093495227627385 | 0.812 | 1.131 | 1.866 |
| 4.096636820280975 | 0.812 | 1.131 | 1.859 |
| 4.099778412934564 | 0.813 | 1.13 | 1.852 |
| 4.102920005588154 | 0.814 | 1.129 | 1.845 |
| 4.106061598241744 | 0.814 | 1.129 | 1.838 |
| 4.109203190895333 | 0.815 | 1.128 | 1.831 |
| 4.112344783548923 | 0.816 | 1.127 | 1.824 |
| 4.115486376202512 | 0.816 | 1.127 | 1.817 |
| 4.118627968856102 | 0.817 | 1.126 | 1.81 |
| 4.121769561509692 | 0.818 | 1.125 | 1.803 |
| 4.124911154163281 | 0.819 | 1.125 | 1.797 |
| 4.128052746816871 | 0.819 | 1.124 | 1.79 |
| 4.13119433947046 | 0.82 | 1.123 | 1.783 |
| 4.13433593212405 | 0.821 | 1.123 | 1.777 |
| 4.13747752477764 | 0.821 | 1.122 | 1.77 |
| 4.14061911743123 | 0.822 | 1.121 | 1.763 |
| 4.143760710084818 | 0.823 | 1.121 | 1.757 |
| 4.146902302738408 | 0.823 | 1.12 | 1.75 |
| 4.150043895391998 | 0.824 | 1.119 | 1.744 |
| 4.153185488045588 | 0.825 | 1.119 | 1.737 |
| 4.156327080699177 | 0.826 | 1.118 | 1.731 |
| 4.159468673352766 | 0.826 | 1.117 | 1.725 |
| 4.162610266006356 | 0.827 | 1.117 | 1.718 |
| 4.165751858659946 | 0.828 | 1.116 | 1.712 |
| 4.168893451313535 | 0.829 | 1.115 | 1.706 |
| 4.172035043967125 | 0.829 | 1.115 | 1.699 |
| 4.175176636620715 | 0.83 | 1.114 | 1.693 |
| 4.178318229274304 | 0.831 | 1.113 | 1.687 |
| 4.181459821927894 | 0.832 | 1.113 | 1.681 |
| 4.184601414581484 | 0.832 | 1.112 | 1.675 |
| 4.187743007235073 | 0.833 | 1.111 | 1.669 |
| 4.190884599888663 | 0.834 | 1.111 | 1.663 |
| 4.194026192542252 | 0.835 | 1.11 | 1.657 |
| 4.197167785195842 | 0.835 | 1.109 | 1.651 |
| 4.200309377849432 | 0.836 | 1.109 | 1.645 |
| 4.203450970503021 | 0.837 | 1.108 | 1.639 |
| 4.206592563156611 | 0.838 | 1.107 | 1.633 |
| 4.2097341558102 | 0.838 | 1.107 | 1.627 |
| 4.21287574846379 | 0.839 | 1.106 | 1.621 |
| 4.21601734111738 | 0.84 | 1.105 | 1.615 |
| 4.21915893377097 | 0.841 | 1.105 | 1.61 |
| 4.222300526424559 | 0.842 | 1.104 | 1.604 |
| 4.225442119078148 | 0.842 | 1.103 | 1.598 |
| 4.228583711731738 | 0.843 | 1.103 | 1.593 |
| 4.231725304385327 | 0.844 | 1.102 | 1.587 |
| 4.234866897038917 | 0.845 | 1.101 | 1.581 |
| 4.238008489692506 | 0.846 | 1.101 | 1.576 |
| 4.241150082346096 | 0.846 | 1.1 | 1.57 |
| 4.244291674999685 | 0.847 | 1.099 | 1.565 |
| 4.247433267653276 | 0.848 | 1.099 | 1.559 |
| 4.250574860306865 | 0.849 | 1.098 | 1.554 |
| 4.253716452960455 | 0.85 | 1.097 | 1.548 |
| 4.256858045614044 | 0.85 | 1.096 | 1.543 |
| 4.259999638267634 | 0.851 | 1.096 | 1.538 |
| 4.263141230921224 | 0.852 | 1.095 | 1.532 |
| 4.266282823574813 | 0.853 | 1.094 | 1.527 |
| 4.269424416228403 | 0.854 | 1.094 | 1.522 |
| 4.272566008881992 | 0.854 | 1.093 | 1.517 |
| 4.275707601535582 | 0.855 | 1.092 | 1.511 |
| 4.27884919418917 | 0.856 | 1.092 | 1.506 |
| 4.28199078684276 | 0.857 | 1.091 | 1.501 |
| 4.285132379496351 | 0.858 | 1.09 | 1.496 |
| 4.28827397214994 | 0.859 | 1.09 | 1.491 |
| 4.29141556480353 | 0.86 | 1.089 | 1.486 |
| 4.294557157457119 | 0.86 | 1.088 | 1.481 |
| 4.29769875011071 | 0.861 | 1.088 | 1.476 |
| 4.300840342764299 | 0.862 | 1.087 | 1.471 |
| 4.303981935417888 | 0.863 | 1.086 | 1.466 |
| 4.307123528071478 | 0.864 | 1.086 | 1.461 |
| 4.310265120725067 | 0.865 | 1.085 | 1.456 |
| 4.313406713378657 | 0.866 | 1.084 | 1.451 |
| 4.316548306032247 | 0.866 | 1.084 | 1.446 |
| 4.319689898685836 | 0.867 | 1.083 | 1.441 |
| 4.322831491339426 | 0.868 | 1.082 | 1.436 |
| 4.325973083993015 | 0.869 | 1.082 | 1.432 |
| 4.329114676646605 | 0.87 | 1.081 | 1.427 |
| 4.332256269300195 | 0.871 | 1.08 | 1.422 |
| 4.335397861953784 | 0.872 | 1.079 | 1.417 |
| 4.338539454607374 | 0.873 | 1.079 | 1.413 |
| 4.341681047260963 | 0.873 | 1.078 | 1.408 |
| 4.344822639914553 | 0.874 | 1.077 | 1.403 |
| 4.347964232568143 | 0.875 | 1.077 | 1.399 |
| 4.351105825221732 | 0.876 | 1.076 | 1.394 |
| 4.354247417875322 | 0.877 | 1.075 | 1.39 |
| 4.357389010528911 | 0.878 | 1.075 | 1.385 |
| 4.360530603182501 | 0.879 | 1.074 | 1.381 |
| 4.36367219583609 | 0.88 | 1.073 | 1.376 |
| 4.36681378848968 | 0.881 | 1.073 | 1.372 |
| 4.36995538114327 | 0.882 | 1.072 | 1.367 |
| 4.373096973796859 | 0.883 | 1.071 | 1.363 |
| 4.376238566450449 | 0.883 | 1.071 | 1.358 |
| 4.379380159104038 | 0.884 | 1.07 | 1.354 |
| 4.382521751757628 | 0.885 | 1.069 | 1.35 |
| 4.385663344411217 | 0.886 | 1.069 | 1.345 |
| 4.388804937064807 | 0.887 | 1.068 | 1.341 |
| 4.391946529718397 | 0.888 | 1.067 | 1.337 |
| 4.395088122371987 | 0.889 | 1.067 | 1.333 |
| 4.398229715025576 | 0.89 | 1.066 | 1.328 |
| 4.401371307679165 | 0.891 | 1.065 | 1.324 |
| 4.404512900332755 | 0.892 | 1.065 | 1.32 |
| 4.407654492986345 | 0.893 | 1.064 | 1.316 |
| 4.410796085639934 | 0.894 | 1.063 | 1.312 |
| 4.413937678293524 | 0.895 | 1.062 | 1.308 |
| 4.417079270947114 | 0.896 | 1.062 | 1.303 |
| 4.420220863600703 | 0.897 | 1.061 | 1.299 |
| 4.423362456254293 | 0.898 | 1.06 | 1.295 |
| 4.426504048907883 | 0.899 | 1.06 | 1.291 |
| 4.429645641561472 | 0.9 | 1.059 | 1.287 |
| 4.432787234215062 | 0.901 | 1.058 | 1.283 |
| 4.435928826868651 | 0.902 | 1.058 | 1.279 |
| 4.43907041952224 | 0.903 | 1.057 | 1.275 |
| 4.44221201217583 | 0.904 | 1.056 | 1.271 |
| 4.44535360482942 | 0.905 | 1.056 | 1.268 |
| 4.44849519748301 | 0.906 | 1.055 | 1.264 |
| 4.4516367901366 | 0.907 | 1.054 | 1.26 |
| 4.454778382790188 | 0.908 | 1.054 | 1.256 |
| 4.457919975443779 | 0.909 | 1.053 | 1.252 |
| 4.461061568097368 | 0.91 | 1.052 | 1.248 |
| 4.464203160750958 | 0.911 | 1.052 | 1.245 |
| 4.467344753404547 | 0.912 | 1.051 | 1.241 |
| 4.470486346058137 | 0.913 | 1.05 | 1.237 |
| 4.473627938711726 | 0.914 | 1.05 | 1.233 |
| 4.476769531365316 | 0.915 | 1.049 | 1.23 |
| 4.479911124018905 | 0.916 | 1.048 | 1.226 |
| 4.483052716672495 | 0.917 | 1.048 | 1.222 |
| 4.486194309326085 | 0.918 | 1.047 | 1.219 |
| 4.489335901979674 | 0.919 | 1.046 | 1.215 |
| 4.492477494633264 | 0.92 | 1.046 | 1.211 |
| 4.495619087286854 | 0.921 | 1.045 | 1.208 |
| 4.498760679940443 | 0.922 | 1.044 | 1.204 |
| 4.501902272594033 | 0.923 | 1.044 | 1.201 |
| 4.505043865247622 | 0.924 | 1.043 | 1.197 |
| 4.508185457901212 | 0.925 | 1.042 | 1.194 |
| 4.511327050554801 | 0.926 | 1.042 | 1.19 |
| 4.514468643208391 | 0.927 | 1.041 | 1.187 |
| 4.517610235861981 | 0.928 | 1.04 | 1.183 |
| 4.520751828515571 | 0.929 | 1.04 | 1.18 |
| 4.52389342116916 | 0.93 | 1.039 | 1.176 |
| 4.52703501382275 | 0.931 | 1.038 | 1.173 |
| 4.530176606476339 | 0.932 | 1.038 | 1.17 |
| 4.533318199129928 | 0.933 | 1.037 | 1.166 |
| 4.536459791783518 | 0.935 | 1.036 | 1.163 |
| 4.539601384437108 | 0.936 | 1.036 | 1.159 |
| 4.542742977090698 | 0.937 | 1.035 | 1.156 |
| 4.545884569744287 | 0.938 | 1.034 | 1.153 |
| 4.549026162397876 | 0.939 | 1.034 | 1.15 |
| 4.552167755051466 | 0.94 | 1.033 | 1.146 |
| 4.555309347705056 | 0.941 | 1.032 | 1.143 |
| 4.558450940358646 | 0.942 | 1.032 | 1.14 |
| 4.561592533012235 | 0.943 | 1.031 | 1.137 |
| 4.564734125665825 | 0.944 | 1.03 | 1.133 |
| 4.567875718319415 | 0.946 | 1.03 | 1.13 |
| 4.571017310973004 | 0.947 | 1.029 | 1.127 |
| 4.574158903626594 | 0.948 | 1.028 | 1.124 |
| 4.577300496280183 | 0.949 | 1.028 | 1.121 |
| 4.580442088933772 | 0.95 | 1.027 | 1.118 |
| 4.583583681587362 | 0.951 | 1.026 | 1.115 |
| 4.586725274240952 | 0.952 | 1.026 | 1.111 |
| 4.589866866894542 | 0.953 | 1.025 | 1.108 |
| 4.593008459548131 | 0.955 | 1.024 | 1.105 |
| 4.596150052201721 | 0.956 | 1.024 | 1.102 |
| 4.59929164485531 | 0.957 | 1.023 | 1.099 |
| 4.6024332375089 | 0.958 | 1.022 | 1.096 |
| 4.60557483016249 | 0.959 | 1.022 | 1.093 |
| 4.608716422816079 | 0.96 | 1.021 | 1.09 |
| 4.611858015469668 | 0.961 | 1.02 | 1.087 |
| 4.614999608123258 | 0.963 | 1.02 | 1.084 |
| 4.618141200776848 | 0.964 | 1.019 | 1.081 |
| 4.621282793430437 | 0.965 | 1.019 | 1.078 |
| 4.624424386084027 | 0.966 | 1.018 | 1.076 |
| 4.627565978737617 | 0.967 | 1.017 | 1.073 |
| 4.630707571391206 | 0.968 | 1.017 | 1.07 |
| 4.633849164044795 | 0.97 | 1.016 | 1.067 |
| 4.636990756698386 | 0.971 | 1.015 | 1.064 |
| 4.640132349351975 | 0.972 | 1.015 | 1.061 |
| 4.643273942005564 | 0.973 | 1.014 | 1.058 |
| 4.646415534659154 | 0.974 | 1.013 | 1.056 |
| 4.649557127312744 | 0.975 | 1.013 | 1.053 |
| 4.652698719966334 | 0.977 | 1.012 | 1.05 |
| 4.655840312619923 | 0.978 | 1.011 | 1.047 |
| 4.658981905273513 | 0.979 | 1.011 | 1.045 |
| 4.662123497927102 | 0.98 | 1.01 | 1.042 |
| 4.665265090580692 | 0.982 | 1.01 | 1.039 |
| 4.668406683234282 | 0.983 | 1.009 | 1.036 |
| 4.671548275887871 | 0.984 | 1.008 | 1.034 |
| 4.674689868541461 | 0.985 | 1.008 | 1.031 |
| 4.67783146119505 | 0.986 | 1.007 | 1.028 |
| 4.68097305384864 | 0.988 | 1.006 | 1.026 |
| 4.68411464650223 | 0.989 | 1.006 | 1.023 |
| 4.687256239155819 | 0.99 | 1.005 | 1.021 |
| 4.690397831809409 | 0.991 | 1.004 | 1.018 |
| 4.693539424462998 | 0.993 | 1.004 | 1.015 |
| 4.696681017116588 | 0.994 | 1.003 | 1.013 |
| 4.699822609770177 | 0.995 | 1.003 | 1.01 |
| 4.702964202423767 | 0.996 | 1.002 | 1.008 |
| 4.706105795077356 | 0.997 | 1.001 | 1.005 |
| 4.709247387730946 | 0.999 | 1.001 | 1.003 |
| 4.712388980384535 | 1 | 1 | 1 |
| 4.715530573038126 | 1.001 | 0.999 | 0.997 |
| 4.718672165691715 | 1.003 | 0.999 | 0.995 |
| 4.721813758345305 | 1.004 | 0.998 | 0.993 |
| 4.724955350998894 | 1.005 | 0.997 | 0.99 |
| 4.728096943652484 | 1.006 | 0.997 | 0.988 |
| 4.731238536306074 | 1.008 | 0.996 | 0.985 |
| 4.734380128959663 | 1.009 | 0.996 | 0.983 |
| 4.737521721613253 | 1.01 | 0.995 | 0.98 |
| 4.740663314266842 | 1.011 | 0.994 | 0.978 |
| 4.743804906920432 | 1.013 | 0.994 | 0.975 |
| 4.74694649957402 | 1.014 | 0.993 | 0.973 |
| 4.750088092227611 | 1.015 | 0.993 | 0.971 |
| 4.7532296848812 | 1.017 | 0.992 | 0.968 |
| 4.75637127753479 | 1.018 | 0.991 | 0.966 |
| 4.75951287018838 | 1.019 | 0.991 | 0.964 |
| 4.76265446284197 | 1.021 | 0.99 | 0.961 |
| 4.765796055495559 | 1.022 | 0.989 | 0.959 |
| 4.768937648149149 | 1.023 | 0.989 | 0.957 |
| 4.772079240802738 | 1.024 | 0.988 | 0.954 |
| 4.775220833456327 | 1.026 | 0.988 | 0.952 |
| 4.778362426109917 | 1.027 | 0.987 | 0.95 |
| 4.781504018763507 | 1.028 | 0.986 | 0.948 |
| 4.784645611417097 | 1.03 | 0.986 | 0.945 |
| 4.787787204070686 | 1.031 | 0.985 | 0.943 |
| 4.790928796724275 | 1.032 | 0.985 | 0.941 |
| 4.794070389377865 | 1.034 | 0.984 | 0.939 |
| 4.797211982031455 | 1.035 | 0.983 | 0.937 |
| 4.800353574685045 | 1.036 | 0.983 | 0.934 |
| 4.803495167338634 | 1.038 | 0.982 | 0.932 |
| 4.806636759992224 | 1.039 | 0.982 | 0.93 |
| 4.809778352645814 | 1.04 | 0.981 | 0.928 |
| 4.812919945299403 | 1.042 | 0.98 | 0.926 |
| 4.816061537952993 | 1.043 | 0.98 | 0.924 |
| 4.819203130606582 | 1.045 | 0.979 | 0.921 |
| 4.822344723260172 | 1.046 | 0.979 | 0.919 |
| 4.825486315913761 | 1.047 | 0.978 | 0.917 |
| 4.828627908567351 | 1.049 | 0.977 | 0.915 |
| 4.83176950122094 | 1.05 | 0.977 | 0.913 |
| 4.83491109387453 | 1.051 | 0.976 | 0.911 |
| 4.83805268652812 | 1.053 | 0.976 | 0.909 |
| 4.841194279181709 | 1.054 | 0.975 | 0.907 |
| 4.844335871835299 | 1.056 | 0.974 | 0.905 |
| 4.847477464488889 | 1.057 | 0.974 | 0.903 |
| 4.850619057142478 | 1.058 | 0.973 | 0.901 |
| 4.853760649796068 | 1.06 | 0.973 | 0.899 |
| 4.856902242449657 | 1.061 | 0.972 | 0.897 |
| 4.860043835103247 | 1.063 | 0.971 | 0.895 |
| 4.863185427756837 | 1.064 | 0.971 | 0.893 |
| 4.866327020410426 | 1.065 | 0.97 | 0.891 |
| 4.869468613064015 | 1.067 | 0.97 | 0.889 |
| 4.872610205717605 | 1.068 | 0.969 | 0.887 |
| 4.875751798371195 | 1.07 | 0.968 | 0.885 |
| 4.878893391024784 | 1.071 | 0.968 | 0.883 |
| 4.882034983678374 | 1.072 | 0.967 | 0.881 |
| 4.885176576331964 | 1.074 | 0.967 | 0.879 |
| 4.888318168985553 | 1.075 | 0.966 | 0.877 |
| 4.891459761639143 | 1.077 | 0.966 | 0.875 |
| 4.894601354292733 | 1.078 | 0.965 | 0.873 |
| 4.897742946946322 | 1.08 | 0.964 | 0.872 |
| 4.900884539599912 | 1.081 | 0.964 | 0.87 |
| 4.904026132253501 | 1.082 | 0.963 | 0.868 |
| 4.907167724907091 | 1.084 | 0.963 | 0.866 |
| 4.91030931756068 | 1.085 | 0.962 | 0.864 |
| 4.91345091021427 | 1.087 | 0.962 | 0.862 |
| 4.91659250286786 | 1.088 | 0.961 | 0.86 |
| 4.91973409552145 | 1.09 | 0.96 | 0.859 |
| 4.922875688175039 | 1.091 | 0.96 | 0.857 |
| 4.926017280828628 | 1.093 | 0.959 | 0.855 |
| 4.929158873482218 | 1.094 | 0.959 | 0.853 |
| 4.932300466135808 | 1.096 | 0.958 | 0.851 |
| 4.935442058789397 | 1.097 | 0.958 | 0.85 |
| 4.938583651442987 | 1.099 | 0.957 | 0.848 |
| 4.941725244096576 | 1.1 | 0.957 | 0.846 |
| 4.944866836750166 | 1.102 | 0.956 | 0.844 |
| 4.948008429403755 | 1.103 | 0.955 | 0.843 |
| 4.951150022057345 | 1.104 | 0.955 | 0.841 |
| 4.954291614710935 | 1.106 | 0.954 | 0.839 |
| 4.957433207364524 | 1.107 | 0.954 | 0.837 |
| 4.960574800018114 | 1.109 | 0.953 | 0.836 |
| 4.963716392671704 | 1.11 | 0.953 | 0.834 |
| 4.966857985325293 | 1.112 | 0.952 | 0.832 |
| 4.969999577978883 | 1.113 | 0.952 | 0.831 |
| 4.973141170632472 | 1.115 | 0.951 | 0.829 |
| 4.976282763286062 | 1.116 | 0.95 | 0.827 |
| 4.979424355939651 | 1.118 | 0.95 | 0.826 |
| 4.982565948593241 | 1.12 | 0.949 | 0.824 |
| 4.985707541246831 | 1.121 | 0.949 | 0.822 |
| 4.98884913390042 | 1.123 | 0.948 | 0.821 |
| 4.99199072655401 | 1.124 | 0.948 | 0.819 |
| 4.9951323192076 | 1.126 | 0.947 | 0.818 |
| 4.99827391186119 | 1.127 | 0.947 | 0.816 |
| 5.00141550451478 | 1.129 | 0.946 | 0.814 |
| 5.004557097168369 | 1.13 | 0.946 | 0.813 |
| 5.007698689821958 | 1.132 | 0.945 | 0.811 |
| 5.010840282475548 | 1.133 | 0.944 | 0.81 |
| 5.013981875129137 | 1.135 | 0.944 | 0.808 |
| 5.017123467782727 | 1.136 | 0.943 | 0.806 |
| 5.020265060436317 | 1.138 | 0.943 | 0.805 |
| 5.023406653089906 | 1.139 | 0.942 | 0.803 |
| 5.026548245743496 | 1.141 | 0.942 | 0.802 |
| 5.029689838397085 | 1.143 | 0.941 | 0.8 |
| 5.032831431050674 | 1.144 | 0.941 | 0.799 |
| 5.035973023704264 | 1.146 | 0.94 | 0.797 |
| 5.039114616357854 | 1.147 | 0.94 | 0.796 |
| 5.042256209011444 | 1.149 | 0.939 | 0.794 |
| 5.045397801665033 | 1.15 | 0.939 | 0.793 |
| 5.048539394318622 | 1.152 | 0.938 | 0.791 |
| 5.051680986972213 | 1.154 | 0.938 | 0.79 |
| 5.054822579625802 | 1.155 | 0.937 | 0.788 |
| 5.057964172279392 | 1.157 | 0.937 | 0.787 |
| 5.061105764932981 | 1.158 | 0.936 | 0.785 |
| 5.064247357586571 | 1.16 | 0.936 | 0.784 |
| 5.067388950240161 | 1.161 | 0.935 | 0.782 |
| 5.07053054289375 | 1.163 | 0.934 | 0.781 |
| 5.07367213554734 | 1.165 | 0.934 | 0.78 |
| 5.07681372820093 | 1.166 | 0.933 | 0.778 |
| 5.079955320854519 | 1.168 | 0.933 | 0.777 |
| 5.083096913508108 | 1.169 | 0.932 | 0.775 |
| 5.086238506161698 | 1.171 | 0.932 | 0.774 |
| 5.089380098815288 | 1.173 | 0.931 | 0.772 |
| 5.092521691468877 | 1.174 | 0.931 | 0.771 |
| 5.095663284122466 | 1.176 | 0.93 | 0.77 |
| 5.098804876776057 | 1.178 | 0.93 | 0.768 |
| 5.101946469429646 | 1.179 | 0.929 | 0.767 |
| 5.105088062083236 | 1.181 | 0.929 | 0.766 |
| 5.108229654736825 | 1.182 | 0.928 | 0.764 |
| 5.111371247390415 | 1.184 | 0.928 | 0.763 |
| 5.114512840044005 | 1.186 | 0.927 | 0.762 |
| 5.117654432697594 | 1.187 | 0.927 | 0.76 |
| 5.120796025351184 | 1.189 | 0.926 | 0.759 |
| 5.123937618004773 | 1.19 | 0.926 | 0.758 |
| 5.127079210658363 | 1.192 | 0.925 | 0.756 |
| 5.130220803311953 | 1.194 | 0.925 | 0.755 |
| 5.133362395965542 | 1.195 | 0.924 | 0.754 |
| 5.136503988619131 | 1.197 | 0.924 | 0.752 |
| 5.13964558127272 | 1.199 | 0.923 | 0.751 |
| 5.142787173926311 | 1.2 | 0.923 | 0.75 |
| 5.1459287665799 | 1.202 | 0.922 | 0.748 |
| 5.14907035923349 | 1.204 | 0.922 | 0.747 |
| 5.15221195188708 | 1.205 | 0.922 | 0.746 |
| 5.15535354454067 | 1.207 | 0.921 | 0.745 |
| 5.158495137194259 | 1.209 | 0.921 | 0.743 |
| 5.161636729847848 | 1.21 | 0.92 | 0.742 |
| 5.164778322501438 | 1.212 | 0.92 | 0.741 |
| 5.167919915155028 | 1.214 | 0.919 | 0.74 |
| 5.171061507808617 | 1.215 | 0.919 | 0.738 |
| 5.174203100462206 | 1.217 | 0.918 | 0.737 |
| 5.177344693115796 | 1.219 | 0.918 | 0.736 |
| 5.180486285769386 | 1.22 | 0.917 | 0.735 |
| 5.183627878422976 | 1.222 | 0.917 | 0.734 |
| 5.186769471076565 | 1.224 | 0.916 | 0.732 |
| 5.189911063730155 | 1.225 | 0.916 | 0.731 |
| 5.193052656383744 | 1.227 | 0.915 | 0.73 |
| 5.196194249037334 | 1.229 | 0.915 | 0.729 |
| 5.199335841690924 | 1.23 | 0.914 | 0.728 |
| 5.202477434344513 | 1.232 | 0.914 | 0.726 |
| 5.205619026998103 | 1.234 | 0.913 | 0.725 |
| 5.208760619651692 | 1.235 | 0.913 | 0.724 |
| 5.211902212305282 | 1.237 | 0.913 | 0.723 |
| 5.215043804958871 | 1.239 | 0.912 | 0.722 |
| 5.218185397612461 | 1.24 | 0.912 | 0.721 |
| 5.221326990266051 | 1.242 | 0.911 | 0.72 |
| 5.22446858291964 | 1.244 | 0.911 | 0.718 |
| 5.22761017557323 | 1.245 | 0.91 | 0.717 |
| 5.23075176822682 | 1.247 | 0.91 | 0.716 |
| 5.23389336088041 | 1.249 | 0.909 | 0.715 |
| 5.237034953533999 | 1.251 | 0.909 | 0.714 |
| 5.240176546187588 | 1.252 | 0.908 | 0.713 |
| 5.243318138841178 | 1.254 | 0.908 | 0.712 |
| 5.246459731494767 | 1.256 | 0.908 | 0.711 |
| 5.249601324148357 | 1.257 | 0.907 | 0.71 |
| 5.252742916801947 | 1.259 | 0.907 | 0.708 |
| 5.255884509455536 | 1.261 | 0.906 | 0.707 |
| 5.259026102109125 | 1.263 | 0.906 | 0.706 |
| 5.262167694762715 | 1.264 | 0.905 | 0.705 |
| 5.265309287416305 | 1.266 | 0.905 | 0.704 |
| 5.268450880069895 | 1.268 | 0.905 | 0.703 |
| 5.271592472723484 | 1.269 | 0.904 | 0.702 |
| 5.274734065377074 | 1.271 | 0.904 | 0.701 |
| 5.277875658030664 | 1.273 | 0.903 | 0.7 |
| 5.281017250684253 | 1.275 | 0.903 | 0.699 |
| 5.284158843337843 | 1.276 | 0.902 | 0.698 |
| 5.287300435991432 | 1.278 | 0.902 | 0.697 |
| 5.290442028645022 | 1.28 | 0.901 | 0.696 |
| 5.293583621298612 | 1.281 | 0.901 | 0.695 |
| 5.296725213952201 | 1.283 | 0.901 | 0.694 |
| 5.299866806605791 | 1.285 | 0.9 | 0.693 |
| 5.30300839925938 | 1.287 | 0.9 | 0.692 |
| 5.30614999191297 | 1.288 | 0.899 | 0.691 |
| 5.30929158456656 | 1.29 | 0.899 | 0.69 |
| 5.312433177220149 | 1.292 | 0.899 | 0.689 |
| 5.315574769873739 | 1.294 | 0.898 | 0.688 |
| 5.318716362527328 | 1.295 | 0.898 | 0.687 |
| 5.321857955180918 | 1.297 | 0.897 | 0.686 |
| 5.324999547834508 | 1.299 | 0.897 | 0.685 |
| 5.328141140488097 | 1.3 | 0.896 | 0.684 |
| 5.331282733141686 | 1.302 | 0.896 | 0.683 |
| 5.334424325795276 | 1.304 | 0.896 | 0.682 |
| 5.337565918448866 | 1.306 | 0.895 | 0.681 |
| 5.340707511102456 | 1.307 | 0.895 | 0.68 |
| 5.343849103756045 | 1.309 | 0.894 | 0.679 |
| 5.346990696409634 | 1.311 | 0.894 | 0.678 |
| 5.350132289063224 | 1.313 | 0.894 | 0.677 |
| 5.353273881716814 | 1.314 | 0.893 | 0.676 |
| 5.356415474370403 | 1.316 | 0.893 | 0.676 |
| 5.359557067023993 | 1.318 | 0.892 | 0.675 |
| 5.362698659677583 | 1.32 | 0.892 | 0.674 |
| 5.365840252331172 | 1.321 | 0.892 | 0.673 |
| 5.368981844984762 | 1.323 | 0.891 | 0.672 |
| 5.372123437638351 | 1.325 | 0.891 | 0.671 |
| 5.375265030291941 | 1.327 | 0.89 | 0.67 |
| 5.378406622945531 | 1.328 | 0.89 | 0.669 |
| 5.38154821559912 | 1.33 | 0.89 | 0.668 |
| 5.38468980825271 | 1.332 | 0.889 | 0.667 |
| 5.387831400906299 | 1.334 | 0.889 | 0.667 |
| 5.39097299355989 | 1.335 | 0.888 | 0.666 |
| 5.394114586213479 | 1.337 | 0.888 | 0.665 |
| 5.397256178867068 | 1.339 | 0.888 | 0.664 |
| 5.400397771520657 | 1.34 | 0.887 | 0.663 |
| 5.403539364174247 | 1.342 | 0.887 | 0.662 |
| 5.406680956827837 | 1.344 | 0.887 | 0.661 |
| 5.409822549481426 | 1.346 | 0.886 | 0.661 |
| 5.412964142135016 | 1.347 | 0.886 | 0.66 |
| 5.416105734788605 | 1.349 | 0.885 | 0.659 |
| 5.419247327442195 | 1.351 | 0.885 | 0.658 |
| 5.422388920095785 | 1.353 | 0.885 | 0.657 |
| 5.425530512749375 | 1.354 | 0.884 | 0.656 |
| 5.428672105402964 | 1.356 | 0.884 | 0.656 |
| 5.431813698056554 | 1.358 | 0.884 | 0.655 |
| 5.434955290710143 | 1.36 | 0.883 | 0.654 |
| 5.438096883363733 | 1.361 | 0.883 | 0.653 |
| 5.441238476017322 | 1.363 | 0.882 | 0.652 |
| 5.444380068670912 | 1.365 | 0.882 | 0.652 |
| 5.447521661324502 | 1.367 | 0.882 | 0.651 |
| 5.450663253978091 | 1.368 | 0.881 | 0.65 |
| 5.453804846631681 | 1.37 | 0.881 | 0.649 |
| 5.456946439285271 | 1.372 | 0.881 | 0.648 |
| 5.46008803193886 | 1.374 | 0.88 | 0.648 |
| 5.46322962459245 | 1.375 | 0.88 | 0.647 |
| 5.466371217246039 | 1.377 | 0.88 | 0.646 |
| 5.46951280989963 | 1.379 | 0.879 | 0.645 |
| 5.472654402553218 | 1.381 | 0.879 | 0.645 |
| 5.475795995206808 | 1.382 | 0.879 | 0.644 |
| 5.478937587860398 | 1.384 | 0.878 | 0.643 |
| 5.482079180513987 | 1.386 | 0.878 | 0.642 |
| 5.485220773167577 | 1.387 | 0.877 | 0.642 |
| 5.488362365821166 | 1.389 | 0.877 | 0.641 |
| 5.491503958474756 | 1.391 | 0.877 | 0.64 |
| 5.494645551128346 | 1.393 | 0.876 | 0.639 |
| 5.497787143781935 | 1.394 | 0.876 | 0.639 |
| 5.500928736435525 | 1.396 | 0.876 | 0.638 |
| 5.504070329089115 | 1.398 | 0.875 | 0.637 |
| 5.507211921742704 | 1.4 | 0.875 | 0.637 |
| 5.510353514396294 | 1.401 | 0.875 | 0.636 |
| 5.513495107049883 | 1.403 | 0.874 | 0.635 |
| 5.516636699703473 | 1.405 | 0.874 | 0.634 |
| 5.519778292357062 | 1.406 | 0.874 | 0.634 |
| 5.522919885010652 | 1.408 | 0.873 | 0.633 |
| 5.526061477664242 | 1.41 | 0.873 | 0.632 |
| 5.529203070317831 | 1.412 | 0.873 | 0.632 |
| 5.532344662971421 | 1.413 | 0.872 | 0.631 |
| 5.535486255625011 | 1.415 | 0.872 | 0.63 |
| 5.5386278482786 | 1.417 | 0.872 | 0.63 |
| 5.54176944093219 | 1.418 | 0.871 | 0.629 |
| 5.544911033585779 | 1.42 | 0.871 | 0.628 |
| 5.54805262623937 | 1.422 | 0.871 | 0.628 |
| 5.551194218892959 | 1.424 | 0.87 | 0.627 |
| 5.554335811546548 | 1.425 | 0.87 | 0.626 |
| 5.557477404200137 | 1.427 | 0.87 | 0.626 |
| 5.560618996853727 | 1.429 | 0.87 | 0.625 |
| 5.563760589507317 | 1.43 | 0.869 | 0.624 |
| 5.566902182160906 | 1.432 | 0.869 | 0.624 |
| 5.570043774814496 | 1.434 | 0.869 | 0.623 |
| 5.573185367468086 | 1.435 | 0.868 | 0.622 |
| 5.576326960121675 | 1.437 | 0.868 | 0.622 |
| 5.579468552775264 | 1.439 | 0.868 | 0.621 |
| 5.582610145428854 | 1.44 | 0.867 | 0.621 |
| 5.585751738082444 | 1.442 | 0.867 | 0.62 |
| 5.588893330736034 | 1.444 | 0.867 | 0.619 |
| 5.592034923389623 | 1.446 | 0.866 | 0.619 |
| 5.595176516043213 | 1.447 | 0.866 | 0.618 |
| 5.598318108696803 | 1.449 | 0.866 | 0.617 |
| 5.601459701350392 | 1.451 | 0.866 | 0.617 |
| 5.604601294003982 | 1.452 | 0.865 | 0.616 |
| 5.607742886657571 | 1.454 | 0.865 | 0.616 |
| 5.610884479311161 | 1.456 | 0.865 | 0.615 |
| 5.61402607196475 | 1.457 | 0.864 | 0.614 |
| 5.61716766461834 | 1.459 | 0.864 | 0.614 |
| 5.62030925727193 | 1.46 | 0.864 | 0.613 |
| 5.623450849925519 | 1.462 | 0.864 | 0.613 |
| 5.626592442579109 | 1.464 | 0.863 | 0.612 |
| 5.629734035232698 | 1.465 | 0.863 | 0.612 |
| 5.632875627886288 | 1.467 | 0.863 | 0.611 |
| 5.636017220539878 | 1.469 | 0.862 | 0.61 |
| 5.639158813193467 | 1.47 | 0.862 | 0.61 |
| 5.642300405847057 | 1.472 | 0.862 | 0.609 |
| 5.645441998500646 | 1.474 | 0.862 | 0.609 |
| 5.648583591154236 | 1.475 | 0.861 | 0.608 |
| 5.651725183807825 | 1.477 | 0.861 | 0.608 |
| 5.654866776461415 | 1.478 | 0.861 | 0.607 |
| 5.658008369115005 | 1.48 | 0.86 | 0.607 |
| 5.661149961768594 | 1.482 | 0.86 | 0.606 |
| 5.664291554422184 | 1.483 | 0.86 | 0.605 |
| 5.667433147075774 | 1.485 | 0.86 | 0.605 |
| 5.670574739729363 | 1.486 | 0.859 | 0.604 |
| 5.673716332382953 | 1.488 | 0.859 | 0.604 |
| 5.676857925036542 | 1.49 | 0.859 | 0.603 |
| 5.679999517690132 | 1.491 | 0.859 | 0.603 |
| 5.683141110343721 | 1.493 | 0.858 | 0.602 |
| 5.686282702997311 | 1.494 | 0.858 | 0.602 |
| 5.689424295650901 | 1.496 | 0.858 | 0.601 |
| 5.69256588830449 | 1.498 | 0.858 | 0.601 |
| 5.69570748095808 | 1.499 | 0.857 | 0.6 |
| 5.69884907361167 | 1.501 | 0.857 | 0.6 |
| 5.701990666265259 | 1.502 | 0.857 | 0.599 |
| 5.705132258918849 | 1.504 | 0.857 | 0.599 |
| 5.708273851572438 | 1.505 | 0.856 | 0.598 |
| 5.711415444226028 | 1.507 | 0.856 | 0.598 |
| 5.714557036879618 | 1.508 | 0.856 | 0.597 |
| 5.717698629533207 | 1.51 | 0.856 | 0.597 |
| 5.720840222186797 | 1.511 | 0.855 | 0.596 |
| 5.723981814840386 | 1.513 | 0.855 | 0.596 |
| 5.727123407493976 | 1.515 | 0.855 | 0.595 |
| 5.730265000147565 | 1.516 | 0.855 | 0.595 |
| 5.733406592801155 | 1.518 | 0.854 | 0.594 |
| 5.736548185454744 | 1.519 | 0.854 | 0.594 |
| 5.739689778108334 | 1.521 | 0.854 | 0.594 |
| 5.742831370761924 | 1.522 | 0.854 | 0.593 |
| 5.745972963415514 | 1.524 | 0.853 | 0.593 |
| 5.749114556069103 | 1.525 | 0.853 | 0.592 |
| 5.752256148722693 | 1.527 | 0.853 | 0.592 |
| 5.755397741376282 | 1.528 | 0.853 | 0.591 |
| 5.758539334029872 | 1.53 | 0.852 | 0.591 |
| 5.761680926683462 | 1.531 | 0.852 | 0.59 |
| 5.764822519337051 | 1.532 | 0.852 | 0.59 |
| 5.767964111990641 | 1.534 | 0.852 | 0.59 |
| 5.77110570464423 | 1.535 | 0.852 | 0.589 |
| 5.77424729729782 | 1.537 | 0.851 | 0.589 |
| 5.77738888995141 | 1.538 | 0.851 | 0.588 |
| 5.780530482605 | 1.54 | 0.851 | 0.588 |
| 5.783672075258588 | 1.541 | 0.851 | 0.587 |
| 5.786813667912178 | 1.543 | 0.85 | 0.587 |
| 5.789955260565768 | 1.544 | 0.85 | 0.587 |
| 5.793096853219358 | 1.545 | 0.85 | 0.586 |
| 5.796238445872947 | 1.547 | 0.85 | 0.586 |
| 5.799380038526537 | 1.548 | 0.85 | 0.585 |
| 5.802521631180126 | 1.55 | 0.849 | 0.585 |
| 5.805663223833715 | 1.551 | 0.849 | 0.585 |
| 5.808804816487306 | 1.552 | 0.849 | 0.584 |
| 5.811946409140895 | 1.554 | 0.849 | 0.584 |
| 5.815088001794485 | 1.555 | 0.849 | 0.583 |
| 5.818229594448074 | 1.557 | 0.848 | 0.583 |
| 5.821371187101663 | 1.558 | 0.848 | 0.583 |
| 5.824512779755254 | 1.559 | 0.848 | 0.582 |
| 5.827654372408843 | 1.561 | 0.848 | 0.582 |
| 5.830795965062433 | 1.562 | 0.848 | 0.582 |
| 5.833937557716022 | 1.563 | 0.847 | 0.581 |
| 5.837079150369612 | 1.565 | 0.847 | 0.581 |
| 5.840220743023201 | 1.566 | 0.847 | 0.58 |
| 5.843362335676791 | 1.567 | 0.847 | 0.58 |
| 5.846503928330381 | 1.569 | 0.847 | 0.58 |
| 5.84964552098397 | 1.57 | 0.846 | 0.579 |
| 5.85278711363756 | 1.571 | 0.846 | 0.579 |
| 5.85592870629115 | 1.572 | 0.846 | 0.579 |
| 5.85907029894474 | 1.574 | 0.846 | 0.578 |
| 5.862211891598329 | 1.575 | 0.846 | 0.578 |
| 5.865353484251918 | 1.576 | 0.845 | 0.578 |
| 5.868495076905508 | 1.578 | 0.845 | 0.577 |
| 5.871636669559098 | 1.579 | 0.845 | 0.577 |
| 5.874778262212687 | 1.58 | 0.845 | 0.577 |
| 5.877919854866277 | 1.581 | 0.845 | 0.576 |
| 5.881061447519866 | 1.583 | 0.845 | 0.576 |
| 5.884203040173456 | 1.584 | 0.844 | 0.576 |
| 5.887344632827046 | 1.585 | 0.844 | 0.575 |
| 5.890486225480635 | 1.586 | 0.844 | 0.575 |
| 5.893627818134224 | 1.587 | 0.844 | 0.575 |
| 5.896769410787814 | 1.589 | 0.844 | 0.574 |
| 5.899911003441404 | 1.59 | 0.844 | 0.574 |
| 5.903052596094994 | 1.591 | 0.843 | 0.574 |
| 5.906194188748583 | 1.592 | 0.843 | 0.573 |
| 5.909335781402172 | 1.593 | 0.843 | 0.573 |
| 5.912477374055762 | 1.594 | 0.843 | 0.573 |
| 5.915618966709352 | 1.596 | 0.843 | 0.573 |
| 5.918760559362942 | 1.597 | 0.843 | 0.572 |
| 5.921902152016531 | 1.598 | 0.842 | 0.572 |
| 5.92504374467012 | 1.599 | 0.842 | 0.572 |
| 5.92818533732371 | 1.6 | 0.842 | 0.571 |
| 5.9313269299773 | 1.601 | 0.842 | 0.571 |
| 5.93446852263089 | 1.602 | 0.842 | 0.571 |
| 5.93761011528448 | 1.603 | 0.842 | 0.571 |
| 5.940751707938068 | 1.605 | 0.841 | 0.57 |
| 5.943893300591658 | 1.606 | 0.841 | 0.57 |
| 5.947034893245248 | 1.607 | 0.841 | 0.57 |
| 5.950176485898837 | 1.608 | 0.841 | 0.569 |
| 5.953318078552427 | 1.609 | 0.841 | 0.569 |
| 5.956459671206017 | 1.61 | 0.841 | 0.569 |
| 5.959601263859606 | 1.611 | 0.841 | 0.569 |
| 5.962742856513196 | 1.612 | 0.84 | 0.568 |
| 5.965884449166785 | 1.613 | 0.84 | 0.568 |
| 5.969026041820375 | 1.614 | 0.84 | 0.568 |
| 5.972167634473964 | 1.615 | 0.84 | 0.568 |
| 5.975309227127554 | 1.616 | 0.84 | 0.567 |
| 5.978450819781144 | 1.617 | 0.84 | 0.567 |
| 5.981592412434733 | 1.618 | 0.84 | 0.567 |
| 5.984734005088323 | 1.619 | 0.84 | 0.567 |
| 5.987875597741913 | 1.62 | 0.839 | 0.566 |
| 5.991017190395502 | 1.621 | 0.839 | 0.566 |
| 5.994158783049092 | 1.622 | 0.839 | 0.566 |
| 5.997300375702681 | 1.623 | 0.839 | 0.566 |
| 6.000441968356271 | 1.624 | 0.839 | 0.566 |
| 6.003583561009861 | 1.625 | 0.839 | 0.565 |
| 6.00672515366345 | 1.626 | 0.839 | 0.565 |
| 6.00986674631704 | 1.626 | 0.839 | 0.565 |
| 6.01300833897063 | 1.627 | 0.838 | 0.565 |
| 6.01614993162422 | 1.628 | 0.838 | 0.564 |
| 6.019291524277808 | 1.629 | 0.838 | 0.564 |
| 6.022433116931398 | 1.63 | 0.838 | 0.564 |
| 6.025574709584988 | 1.631 | 0.838 | 0.564 |
| 6.028716302238577 | 1.632 | 0.838 | 0.564 |
| 6.031857894892167 | 1.632 | 0.838 | 0.563 |
| 6.034999487545757 | 1.633 | 0.838 | 0.563 |
| 6.038141080199346 | 1.634 | 0.838 | 0.563 |
| 6.041282672852935 | 1.635 | 0.837 | 0.563 |
| 6.044424265506525 | 1.636 | 0.837 | 0.563 |
| 6.047565858160115 | 1.637 | 0.837 | 0.562 |
| 6.050707450813704 | 1.637 | 0.837 | 0.562 |
| 6.053849043467294 | 1.638 | 0.837 | 0.562 |
| 6.056990636120884 | 1.639 | 0.837 | 0.562 |
| 6.060132228774473 | 1.64 | 0.837 | 0.562 |
| 6.063273821428063 | 1.64 | 0.837 | 0.562 |
| 6.066415414081653 | 1.641 | 0.837 | 0.561 |
| 6.069557006735242 | 1.642 | 0.837 | 0.561 |
| 6.072698599388831 | 1.642 | 0.836 | 0.561 |
| 6.07584019204242 | 1.643 | 0.836 | 0.561 |
| 6.078981784696011 | 1.644 | 0.836 | 0.561 |
| 6.082123377349601 | 1.645 | 0.836 | 0.561 |
| 6.08526497000319 | 1.645 | 0.836 | 0.56 |
| 6.08840656265678 | 1.646 | 0.836 | 0.56 |
| 6.09154815531037 | 1.647 | 0.836 | 0.56 |
| 6.094689747963959 | 1.647 | 0.836 | 0.56 |
| 6.097831340617549 | 1.648 | 0.836 | 0.56 |
| 6.100972933271138 | 1.648 | 0.836 | 0.56 |
| 6.104114525924728 | 1.649 | 0.836 | 0.56 |
| 6.107256118578317 | 1.65 | 0.835 | 0.559 |
| 6.110397711231907 | 1.65 | 0.835 | 0.559 |
| 6.113539303885497 | 1.651 | 0.835 | 0.559 |
| 6.116680896539086 | 1.651 | 0.835 | 0.559 |
| 6.119822489192675 | 1.652 | 0.835 | 0.559 |
| 6.122964081846265 | 1.653 | 0.835 | 0.559 |
| 6.126105674499855 | 1.653 | 0.835 | 0.559 |
| 6.129247267153445 | 1.654 | 0.835 | 0.558 |
| 6.132388859807034 | 1.654 | 0.835 | 0.558 |
| 6.135530452460624 | 1.655 | 0.835 | 0.558 |
| 6.138672045114213 | 1.655 | 0.835 | 0.558 |
| 6.141813637767803 | 1.656 | 0.835 | 0.558 |
| 6.144955230421393 | 1.656 | 0.835 | 0.558 |
| 6.148096823074982 | 1.657 | 0.835 | 0.558 |
| 6.151238415728571 | 1.657 | 0.835 | 0.558 |
| 6.154380008382161 | 1.658 | 0.834 | 0.558 |
| 6.157521601035751 | 1.658 | 0.834 | 0.558 |
| 6.16066319368934 | 1.658 | 0.834 | 0.557 |
| 6.16380478634293 | 1.659 | 0.834 | 0.557 |
| 6.16694637899652 | 1.659 | 0.834 | 0.557 |
| 6.170087971650109 | 1.66 | 0.834 | 0.557 |
| 6.173229564303698 | 1.66 | 0.834 | 0.557 |
| 6.176371156957289 | 1.66 | 0.834 | 0.557 |
| 6.179512749610878 | 1.661 | 0.834 | 0.557 |
| 6.182654342264468 | 1.661 | 0.834 | 0.557 |
| 6.185795934918057 | 1.661 | 0.834 | 0.557 |
| 6.188937527571647 | 1.662 | 0.834 | 0.557 |
| 6.192079120225237 | 1.662 | 0.834 | 0.557 |
| 6.195220712878826 | 1.662 | 0.834 | 0.557 |
| 6.198362305532415 | 1.663 | 0.834 | 0.556 |
| 6.201503898186005 | 1.663 | 0.834 | 0.556 |
| 6.204645490839594 | 1.663 | 0.834 | 0.556 |
| 6.207787083493184 | 1.664 | 0.834 | 0.556 |
| 6.210928676146774 | 1.664 | 0.834 | 0.556 |
| 6.214070268800364 | 1.664 | 0.834 | 0.556 |
| 6.217211861453953 | 1.664 | 0.834 | 0.556 |
| 6.220353454107543 | 1.664 | 0.834 | 0.556 |
| 6.223495046761133 | 1.665 | 0.834 | 0.556 |
| 6.226636639414722 | 1.665 | 0.834 | 0.556 |
| 6.229778232068312 | 1.665 | 0.834 | 0.556 |
| 6.232919824721901 | 1.665 | 0.834 | 0.556 |
| 6.236061417375491 | 1.665 | 0.833 | 0.556 |
| 6.23920301002908 | 1.666 | 0.833 | 0.556 |
| 6.24234460268267 | 1.666 | 0.833 | 0.556 |
| 6.24548619533626 | 1.666 | 0.833 | 0.556 |
| 6.24862778798985 | 1.666 | 0.833 | 0.556 |
| 6.251769380643438 | 1.666 | 0.833 | 0.556 |
| 6.254910973297028 | 1.666 | 0.833 | 0.556 |
| 6.258052565950618 | 1.666 | 0.833 | 0.556 |
| 6.261194158604208 | 1.666 | 0.833 | 0.556 |
| 6.264335751257797 | 1.666 | 0.833 | 0.556 |
| 6.267477343911387 | 1.667 | 0.833 | 0.556 |
| 6.270618936564976 | 1.667 | 0.833 | 0.556 |
| 6.273760529218566 | 1.667 | 0.833 | 0.556 |
| 6.276902121872155 | 1.667 | 0.833 | 0.556 |
| 6.280043714525745 | 1.667 | 0.833 | 0.556 |
| 6.283185307179335 | 1.667 | 0.833 | 0.556 |